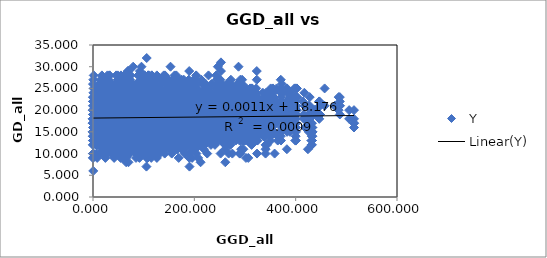
| Category | Y |
|---|---|
| 0.0 | 18 |
| 222.4649658203125 | 18 |
| 222.4649658203125 | 22 |
| 213.76522827148438 | 27 |
| 213.76522827148438 | 19 |
| 9.374117851257324 | 22 |
| 257.4018249511719 | 21 |
| 257.4018249511719 | 24 |
| 36.804473876953125 | 11 |
| 44.29213333129883 | 20 |
| 264.22344970703125 | 24 |
| 264.22344970703125 | 25 |
| 44.31821060180664 | 20 |
| 51.590065002441406 | 27 |
| 7.601124286651611 | 21 |
| 264.22344970703125 | 17 |
| 264.22344970703125 | 21 |
| 44.31821060180664 | 16 |
| 51.590065002441406 | 26 |
| 7.601124286651611 | 21 |
| 0.0 | 17 |
| 173.07127380371094 | 24 |
| 173.07127380371094 | 23 |
| 118.81575775146484 | 24 |
| 116.24177551269531 | 28 |
| 151.6311492919922 | 23 |
| 159.01612854003906 | 19 |
| 159.01612854003906 | 22 |
| 190.77919006347656 | 25 |
| 190.77919006347656 | 24 |
| 96.27040100097656 | 23 |
| 95.08282470703125 | 23 |
| 127.07388305664062 | 23 |
| 134.2930450439453 | 21 |
| 134.2930450439453 | 24 |
| 27.10545539855957 | 11 |
| 260.4430236816406 | 18 |
| 260.4430236816406 | 19 |
| 48.628448486328125 | 18 |
| 57.47843933105469 | 25 |
| 45.259212493896484 | 22 |
| 49.255279541015625 | 19 |
| 49.255279541015625 | 19 |
| 126.10540771484375 | 15 |
| 99.27521514892578 | 16 |
| 260.4430236816406 | 17 |
| 260.4430236816406 | 18 |
| 48.628448486328125 | 19 |
| 57.47843933105469 | 20 |
| 45.259212493896484 | 21 |
| 49.255279541015625 | 17 |
| 49.255279541015625 | 17 |
| 126.10540771484375 | 17 |
| 99.27521514892578 | 18 |
| 0.0 | 9 |
| 229.71290588378906 | 20 |
| 229.71290588378906 | 19 |
| 53.67777633666992 | 20 |
| 57.8973388671875 | 23 |
| 74.22978973388672 | 24 |
| 80.66748809814453 | 18 |
| 80.66748809814453 | 20 |
| 85.42356872558594 | 18 |
| 58.5223388671875 | 15 |
| 40.76374816894531 | 11 |
| 40.76374816894531 | 12 |
| 199.89532470703125 | 26 |
| 199.89532470703125 | 24 |
| 95.00555419921875 | 22 |
| 94.71145629882812 | 27 |
| 124.07469177246094 | 21 |
| 131.1192169189453 | 19 |
| 131.1192169189453 | 23 |
| 34.50121307373047 | 19 |
| 9.145140647888184 | 21 |
| 93.73696899414062 | 17 |
| 93.73696899414062 | 17 |
| 53.09325408935547 | 19 |
| 168.58895874023438 | 20 |
| 168.58895874023438 | 23 |
| 124.61155700683594 | 21 |
| 121.74211883544922 | 23 |
| 157.82974243164062 | 19 |
| 165.24754333496094 | 22 |
| 165.24754333496094 | 24 |
| 6.902673721313477 | 17 |
| 33.99543762207031 | 16 |
| 132.88478088378906 | 16 |
| 132.88478088378906 | 16 |
| 92.23468017578125 | 18 |
| 41.370235443115234 | 15 |
| 172.9572296142578 | 26 |
| 172.9572296142578 | 21 |
| 118.35059356689453 | 24 |
| 115.76432037353516 | 28 |
| 151.19163513183594 | 25 |
| 158.57936096191406 | 21 |
| 158.57936096191406 | 25 |
| 0.4980524182319641 | 14 |
| 26.79340934753418 | 18 |
| 125.7448959350586 | 12 |
| 125.7448959350586 | 19 |
| 85.07196807861328 | 17 |
| 34.26164627075195 | 17 |
| 7.202051639556885 | 18 |
| 173.07127380371094 | 22 |
| 173.07127380371094 | 18 |
| 118.81575775146484 | 20 |
| 116.24177551269531 | 22 |
| 151.6311492919922 | 20 |
| 159.01612854003906 | 19 |
| 159.01612854003906 | 18 |
| 0.0 | 13 |
| 27.10545539855957 | 17 |
| 126.10540771484375 | 9 |
| 126.10540771484375 | 13 |
| 85.42356872558594 | 15 |
| 34.50121307373047 | 13 |
| 6.902673721313477 | 17 |
| 0.4980524182319641 | 6 |
| 371.6860046386719 | 24 |
| 371.6860046386719 | 25 |
| 149.3632049560547 | 23 |
| 157.931884765625 | 24 |
| 114.56051635742188 | 26 |
| 108.13995361328125 | 26 |
| 108.13995361328125 | 23 |
| 246.0194549560547 | 19 |
| 218.96841430664062 | 20 |
| 120.48719787597656 | 18 |
| 120.48719787597656 | 17 |
| 160.7100067138672 | 21 |
| 212.62681579589844 | 22 |
| 252.86744689941406 | 16 |
| 245.6824188232422 | 20 |
| 246.0194549560547 | 15 |
| 248.31565856933594 | 19 |
| 248.31565856933594 | 23 |
| 82.35027313232422 | 20 |
| 87.39813232421875 | 23 |
| 96.56301879882812 | 24 |
| 101.88035583496094 | 20 |
| 101.88035583496094 | 20 |
| 88.33466339111328 | 16 |
| 62.37193298339844 | 14 |
| 54.16267776489258 | 11 |
| 54.16267776489258 | 14 |
| 29.965078353881836 | 15 |
| 53.961639404296875 | 18 |
| 95.13888549804688 | 13 |
| 88.1233139038086 | 16 |
| 88.33466339111328 | 15 |
| 163.852294921875 | 17 |
| 290.7441711425781 | 27 |
| 290.7441711425781 | 24 |
| 80.10026550292969 | 24 |
| 89.18231201171875 | 28 |
| 67.09288787841797 | 25 |
| 67.921142578125 | 24 |
| 67.921142578125 | 25 |
| 146.69772338867188 | 17 |
| 119.64244079589844 | 19 |
| 32.10920715332031 | 12 |
| 32.10920715332031 | 19 |
| 63.724605560302734 | 18 |
| 112.5268325805664 | 16 |
| 153.59983825683594 | 15 |
| 146.40512084960938 | 14 |
| 146.69772338867188 | 12 |
| 101.6820297241211 | 18 |
| 62.172630310058594 | 19 |
| 303.2703552246094 | 23 |
| 303.2703552246094 | 22 |
| 87.46601867675781 | 23 |
| 96.80699157714844 | 25 |
| 67.4734878540039 | 26 |
| 66.44381713867188 | 21 |
| 66.44381713867188 | 24 |
| 162.6663818359375 | 21 |
| 135.5751190185547 | 20 |
| 42.83417892456055 | 18 |
| 42.83417892456055 | 18 |
| 78.7713623046875 | 17 |
| 128.6339111328125 | 20 |
| 169.56417846679688 | 15 |
| 162.3635711669922 | 16 |
| 162.6663818359375 | 19 |
| 85.24528503417969 | 20 |
| 78.61475372314453 | 14 |
| 16.443693161010742 | 17 |
| 198.14268493652344 | 20 |
| 198.14268493652344 | 17 |
| 102.39704895019531 | 22 |
| 101.90559387207031 | 25 |
| 131.66151428222656 | 24 |
| 138.70901489257812 | 16 |
| 138.70901489257812 | 21 |
| 29.082876205444336 | 17 |
| 9.815465927124023 | 17 |
| 101.04747009277344 | 13 |
| 101.04747009277344 | 12 |
| 60.49484634399414 | 13 |
| 7.589998245239258 | 17 |
| 35.773502349853516 | 15 |
| 28.920522689819336 | 16 |
| 29.082876205444336 | 14 |
| 219.57435607910156 | 20 |
| 59.470767974853516 | 16 |
| 119.11138153076172 | 16 |
| 135.3101806640625 | 12 |
| 157.2509765625 | 23 |
| 157.2509765625 | 22 |
| 198.279541015625 | 21 |
| 194.47914123535156 | 26 |
| 232.45977783203125 | 23 |
| 239.93833923339844 | 22 |
| 239.93833923339844 | 21 |
| 81.66677856445312 | 21 |
| 108.281494140625 | 16 |
| 207.5562286376953 | 9 |
| 207.5562286376953 | 17 |
| 166.79855346679688 | 13 |
| 114.2761459350586 | 23 |
| 75.07343292236328 | 18 |
| 82.05875396728516 | 13 |
| 81.66677856445312 | 12 |
| 326.9018859863281 | 22 |
| 165.4676971435547 | 17 |
| 226.38809204101562 | 16 |
| 242.64572143554688 | 19 |
| 107.37771606445312 | 15 |
| 317.2943115234375 | 23 |
| 317.2943115234375 | 23 |
| 95.39566802978516 | 22 |
| 104.517822265625 | 25 |
| 64.8933334350586 | 26 |
| 60.490684509277344 | 20 |
| 60.490684509277344 | 23 |
| 187.7583770751953 | 20 |
| 160.7459716796875 | 20 |
| 62.12656784057617 | 12 |
| 62.12656784057617 | 17 |
| 102.38329315185547 | 15 |
| 154.59481811523438 | 19 |
| 194.59153747558594 | 20 |
| 187.41525268554688 | 17 |
| 187.7583770751953 | 13 |
| 58.37408447265625 | 19 |
| 107.56597900390625 | 18 |
| 46.50164031982422 | 19 |
| 31.206043243408203 | 17 |
| 161.64964294433594 | 18 |
| 268.8425598144531 | 19 |
| 275.63037109375 | 22 |
| 275.63037109375 | 17 |
| 64.51190948486328 | 25 |
| 73.50430297851562 | 22 |
| 55.235435485839844 | 27 |
| 57.42314910888672 | 24 |
| 57.42314910888672 | 23 |
| 135.768798828125 | 20 |
| 108.67538452148438 | 19 |
| 16.237546920776367 | 19 |
| 16.237546920776367 | 16 |
| 50.98674774169922 | 19 |
| 102.21112823486328 | 23 |
| 142.64208984375 | 15 |
| 135.44432067871094 | 20 |
| 135.768798828125 | 16 |
| 110.41656494140625 | 16 |
| 55.85599899291992 | 19 |
| 15.875600814819336 | 22 |
| 28.16462516784668 | 19 |
| 109.1721420288086 | 15 |
| 216.48538208007812 | 21 |
| 52.59881591796875 | 21 |
| 322.701171875 | 24 |
| 322.701171875 | 19 |
| 101.273681640625 | 24 |
| 110.47496795654297 | 23 |
| 71.64637756347656 | 25 |
| 67.45255279541016 | 22 |
| 67.45255279541016 | 23 |
| 190.45628356933594 | 15 |
| 163.3778076171875 | 16 |
| 65.68816375732422 | 10 |
| 65.68816375732422 | 18 |
| 105.3132553100586 | 17 |
| 156.9441375732422 | 20 |
| 197.31924438476562 | 17 |
| 190.1261444091797 | 9 |
| 190.45628356933594 | 7 |
| 55.70664978027344 | 20 |
| 108.55449676513672 | 16 |
| 46.62082290649414 | 15 |
| 30.459213256835938 | 20 |
| 163.8722686767578 | 13 |
| 271.2134704589844 | 12 |
| 7.208616733551025 | 16 |
| 54.738197326660156 | 15 |
| 310.5208740234375 | 18 |
| 310.5208740234375 | 20 |
| 88.81104278564453 | 18 |
| 97.98167419433594 | 25 |
| 59.183876037597656 | 21 |
| 55.232418060302734 | 20 |
| 55.232418060302734 | 18 |
| 181.04318237304688 | 16 |
| 154.0563507080078 | 17 |
| 55.27133560180664 | 10 |
| 55.27133560180664 | 11 |
| 95.6384048461914 | 13 |
| 147.9942169189453 | 16 |
| 187.8668975830078 | 14 |
| 180.6966094970703 | 13 |
| 181.04318237304688 | 10 |
| 65.21694946289062 | 16 |
| 101.57926177978516 | 16 |
| 41.33518981933594 | 12 |
| 27.064321517944336 | 16 |
| 155.08851623535156 | 12 |
| 262.208740234375 | 15 |
| 6.946103572845459 | 17 |
| 46.229427337646484 | 14 |
| 12.584607124328613 | 14 |
| 246.2540283203125 | 23 |
| 246.2540283203125 | 21 |
| 49.28633499145508 | 21 |
| 56.29104232788086 | 24 |
| 59.59392547607422 | 27 |
| 65.09765625 | 20 |
| 65.09765625 | 21 |
| 105.94261169433594 | 19 |
| 78.99954986572266 | 19 |
| 20.497783660888672 | 10 |
| 20.497783660888672 | 16 |
| 20.529987335205078 | 14 |
| 73.28009796142578 | 18 |
| 112.75993347167969 | 18 |
| 105.59336853027344 | 14 |
| 105.94261169433594 | 9 |
| 140.18898010253906 | 17 |
| 36.99909973144531 | 15 |
| 44.804874420166016 | 13 |
| 59.01220703125 | 20 |
| 80.56533813476562 | 17 |
| 187.24754333496094 | 16 |
| 81.85441589355469 | 13 |
| 30.915517807006836 | 18 |
| 84.85062408447266 | 9 |
| 75.1091537475586 | 14 |
| 275.8211669921875 | 25 |
| 275.8211669921875 | 25 |
| 65.03072357177734 | 20 |
| 74.00328063964844 | 25 |
| 55.947059631347656 | 24 |
| 58.144107818603516 | 26 |
| 58.144107818603516 | 27 |
| 135.5802459716797 | 20 |
| 108.48265075683594 | 19 |
| 16.66560935974121 | 15 |
| 16.66560935974121 | 21 |
| 50.89015579223633 | 16 |
| 101.97620391845703 | 24 |
| 142.45664978027344 | 19 |
| 135.25772094726562 | 15 |
| 135.5802459716797 | 15 |
| 110.6597900390625 | 24 |
| 55.39248275756836 | 17 |
| 15.488218307495117 | 18 |
| 28.128074645996094 | 22 |
| 108.91761016845703 | 20 |
| 216.2462158203125 | 16 |
| 52.914249420166016 | 19 |
| 0.7214439511299133 | 23 |
| 54.968017578125 | 13 |
| 46.58121109008789 | 19 |
| 30.900455474853516 | 13 |
| 347.0801086425781 | 24 |
| 347.0801086425781 | 21 |
| 125.58894348144531 | 21 |
| 134.75660705566406 | 24 |
| 94.96224975585938 | 23 |
| 90.15449523925781 | 19 |
| 90.15449523925781 | 22 |
| 212.32965087890625 | 18 |
| 185.22657775878906 | 16 |
| 89.16010284423828 | 11 |
| 89.16010284423828 | 16 |
| 127.8288803100586 | 16 |
| 178.3788299560547 | 15 |
| 219.2220001220703 | 16 |
| 212.0199737548828 | 12 |
| 212.32965087890625 | 8 |
| 37.504554748535156 | 17 |
| 127.95357513427734 | 16 |
| 66.0609359741211 | 14 |
| 49.76592254638672 | 20 |
| 185.0752410888672 | 15 |
| 292.40966796875 | 11 |
| 30.32223129272461 | 11 |
| 76.84693145751953 | 18 |
| 24.390153884887695 | 9 |
| 36.77824020385742 | 15 |
| 107.58628845214844 | 9 |
| 76.96444702148438 | 12 |
| 246.2540283203125 | 20 |
| 246.2540283203125 | 18 |
| 49.28633499145508 | 21 |
| 56.29104232788086 | 22 |
| 59.59392547607422 | 25 |
| 65.09765625 | 16 |
| 65.09765625 | 20 |
| 105.94261169433594 | 15 |
| 78.99954986572266 | 16 |
| 20.497783660888672 | 10 |
| 20.497783660888672 | 12 |
| 20.529987335205078 | 14 |
| 73.28009796142578 | 13 |
| 112.75993347167969 | 15 |
| 105.59336853027344 | 12 |
| 105.94261169433594 | 11 |
| 140.18898010253906 | 18 |
| 36.99909973144531 | 11 |
| 44.804874420166016 | 17 |
| 59.01220703125 | 16 |
| 80.56533813476562 | 12 |
| 187.24754333496094 | 18 |
| 81.85441589355469 | 15 |
| 30.915517807006836 | 15 |
| 84.85062408447266 | 10 |
| 75.1091537475586 | 12 |
| 0.0 | 9 |
| 30.900455474853516 | 16 |
| 107.58628845214844 | 13 |
| 322.07733154296875 | 18 |
| 322.07733154296875 | 19 |
| 100.55109405517578 | 19 |
| 109.73844909667969 | 28 |
| 70.74176025390625 | 23 |
| 66.49687194824219 | 19 |
| 66.49687194824219 | 19 |
| 190.28704833984375 | 16 |
| 163.2164306640625 | 17 |
| 65.3514175415039 | 10 |
| 65.3514175415039 | 10 |
| 105.09424591064453 | 16 |
| 156.8266143798828 | 18 |
| 197.14581298828125 | 17 |
| 189.95481872558594 | 17 |
| 190.28704833984375 | 13 |
| 55.801475524902344 | 21 |
| 108.63719940185547 | 15 |
| 46.79303741455078 | 19 |
| 30.723114013671875 | 22 |
| 163.7754669189453 | 16 |
| 271.1009216308594 | 15 |
| 6.160338878631592 | 18 |
| 54.6156120300293 | 16 |
| 1.0853439569473267 | 18 |
| 11.781150817871094 | 12 |
| 84.61422729492188 | 17 |
| 54.858856201171875 | 21 |
| 25.057863235473633 | 13 |
| 84.61422729492188 | 12 |
| 337.5080871582031 | 22 |
| 337.5080871582031 | 21 |
| 116.46410369873047 | 24 |
| 125.69670104980469 | 27 |
| 86.92608642578125 | 26 |
| 82.56330108642578 | 23 |
| 82.56330108642578 | 22 |
| 202.18360900878906 | 17 |
| 175.0794677734375 | 18 |
| 79.09371185302734 | 15 |
| 79.09371185302734 | 18 |
| 117.6618881225586 | 16 |
| 168.26004028320312 | 21 |
| 209.0747528076172 | 18 |
| 201.87269592285156 | 15 |
| 202.18360900878906 | 15 |
| 46.45109176635742 | 19 |
| 118.05816650390625 | 19 |
| 56.043670654296875 | 17 |
| 39.69001770019531 | 17 |
| 174.97857666015625 | 15 |
| 282.3282775878906 | 16 |
| 22.077699661254883 | 21 |
| 66.67927551269531 | 14 |
| 15.347365379333496 | 14 |
| 27.93012237548828 | 10 |
| 97.4280776977539 | 18 |
| 66.79673767089844 | 22 |
| 10.167814254760742 | 18 |
| 97.4280776977539 | 15 |
| 16.202625274658203 | 16 |
| 314.158447265625 | 22 |
| 314.158447265625 | 25 |
| 92.92469787597656 | 21 |
| 102.1614761352539 | 28 |
| 64.17893981933594 | 24 |
| 60.44082260131836 | 18 |
| 60.44082260131836 | 19 |
| 182.37896728515625 | 17 |
| 155.32546997070312 | 20 |
| 57.24617004394531 | 16 |
| 57.24617004394531 | 17 |
| 97.11376190185547 | 17 |
| 149.02572631835938 | 20 |
| 189.2296905517578 | 20 |
| 182.04299926757812 | 22 |
| 182.37896728515625 | 18 |
| 63.642948150634766 | 23 |
| 101.43550872802734 | 20 |
| 40.110755920410156 | 20 |
| 24.724863052368164 | 16 |
| 156.0201416015625 | 18 |
| 263.3000183105469 | 21 |
| 6.481231212615967 | 15 |
| 46.856040954589844 | 21 |
| 8.598342895507812 | 20 |
| 5.465921401977539 | 15 |
| 76.61265563964844 | 17 |
| 47.13227081298828 | 22 |
| 32.9228630065918 | 18 |
| 76.61265563964844 | 17 |
| 8.132476806640625 | 19 |
| 23.539653778076172 | 14 |
| 246.2540283203125 | 20 |
| 246.2540283203125 | 21 |
| 49.28633499145508 | 22 |
| 56.29104232788086 | 23 |
| 59.59392547607422 | 24 |
| 65.09765625 | 18 |
| 65.09765625 | 21 |
| 105.94261169433594 | 12 |
| 78.99954986572266 | 15 |
| 20.497783660888672 | 14 |
| 20.497783660888672 | 17 |
| 20.529987335205078 | 13 |
| 73.28009796142578 | 17 |
| 112.75993347167969 | 13 |
| 105.59336853027344 | 14 |
| 105.94261169433594 | 14 |
| 140.18898010253906 | 16 |
| 36.99909973144531 | 15 |
| 44.804874420166016 | 18 |
| 59.01220703125 | 19 |
| 80.56533813476562 | 14 |
| 187.24754333496094 | 16 |
| 81.85441589355469 | 15 |
| 30.915517807006836 | 15 |
| 84.85062408447266 | 14 |
| 75.1091537475586 | 15 |
| 0.0 | 17 |
| 30.900455474853516 | 20 |
| 107.58628845214844 | 15 |
| 0.0 | 15 |
| 84.61422729492188 | 16 |
| 97.4280776977539 | 12 |
| 76.61265563964844 | 19 |
| 266.0417785644531 | 26 |
| 266.0417785644531 | 21 |
| 64.40113067626953 | 25 |
| 72.5329818725586 | 20 |
| 64.17170715332031 | 22 |
| 67.83060455322266 | 19 |
| 67.83060455322266 | 20 |
| 120.96961212158203 | 19 |
| 93.87242126464844 | 16 |
| 18.993860244750977 | 15 |
| 18.993860244750977 | 15 |
| 37.68875503540039 | 16 |
| 87.04053497314453 | 18 |
| 127.86532592773438 | 18 |
| 120.66390228271484 | 16 |
| 120.96961212158203 | 12 |
| 125.83783721923828 | 20 |
| 39.852237701416016 | 19 |
| 26.105321884155273 | 19 |
| 41.71109390258789 | 20 |
| 93.83827209472656 | 17 |
| 201.21588134765625 | 14 |
| 68.41474914550781 | 20 |
| 16.04729652404785 | 16 |
| 70.14277648925781 | 12 |
| 62.16349411010742 | 16 |
| 19.970983505249023 | 17 |
| 15.626886367797852 | 22 |
| 91.3724594116211 | 16 |
| 19.970983505249023 | 15 |
| 70.09640502929688 | 18 |
| 81.23793029785156 | 14 |
| 62.516632080078125 | 21 |
| 19.970983505249023 | 13 |
| 371.4516906738281 | 23 |
| 371.4516906738281 | 20 |
| 148.9880828857422 | 21 |
| 157.73440551757812 | 23 |
| 114.93942260742188 | 22 |
| 108.81005859375 | 14 |
| 108.81005859375 | 20 |
| 242.89808654785156 | 14 |
| 215.8076934814453 | 12 |
| 117.96956634521484 | 14 |
| 117.96956634521484 | 12 |
| 157.79806518554688 | 12 |
| 209.2581329345703 | 19 |
| 249.7676544189453 | 18 |
| 242.57159423828125 | 19 |
| 242.89808654785156 | 16 |
| 7.60078763961792 | 21 |
| 159.6901092529297 | 14 |
| 97.5710678100586 | 20 |
| 81.1413345336914 | 19 |
| 216.10540771484375 | 15 |
| 323.4817199707031 | 16 |
| 55.97972869873047 | 16 |
| 107.13277435302734 | 18 |
| 52.48496627807617 | 18 |
| 62.91604995727539 | 14 |
| 137.3286895751953 | 17 |
| 107.33283996582031 | 20 |
| 32.14366912841797 | 15 |
| 137.3286895751953 | 11 |
| 52.71681213378906 | 11 |
| 41.694725036621094 | 19 |
| 60.760536193847656 | 17 |
| 137.3286895751953 | 16 |
| 122.26859283447266 | 16 |
| 253.3990936279297 | 20 |
| 253.3990936279297 | 21 |
| 42.96011734008789 | 20 |
| 51.53498840332031 | 24 |
| 44.5643424987793 | 23 |
| 49.48000717163086 | 21 |
| 49.48000717163086 | 20 |
| 120.50138854980469 | 18 |
| 93.8476333618164 | 15 |
| 7.045741558074951 | 12 |
| 7.045741558074951 | 15 |
| 35.593868255615234 | 12 |
| 88.6811294555664 | 21 |
| 127.23346710205078 | 17 |
| 120.12918853759766 | 12 |
| 120.50138854980469 | 11 |
| 126.72303771972656 | 21 |
| 52.47110366821289 | 13 |
| 38.83311462402344 | 19 |
| 49.87989044189453 | 18 |
| 96.08831787109375 | 16 |
| 202.08428955078125 | 11 |
| 68.44416046142578 | 20 |
| 22.983238220214844 | 18 |
| 72.26660919189453 | 11 |
| 61.540462493896484 | 15 |
| 16.38667106628418 | 14 |
| 23.345216751098633 | 11 |
| 95.91696166992188 | 13 |
| 16.38667106628418 | 14 |
| 71.89149475097656 | 16 |
| 85.88482666015625 | 16 |
| 63.76576232910156 | 18 |
| 16.38667106628418 | 17 |
| 22.048954010009766 | 16 |
| 124.38761901855469 | 15 |
| 322.1430969238281 | 25 |
| 322.1430969238281 | 22 |
| 102.78824615478516 | 24 |
| 112.13762664794922 | 26 |
| 76.5759048461914 | 25 |
| 73.45314025878906 | 22 |
| 73.45314025878906 | 23 |
| 184.43881225585938 | 18 |
| 157.3392333984375 | 16 |
| 62.41310119628906 | 14 |
| 62.41310119628906 | 19 |
| 100.16773223876953 | 17 |
| 150.45802307128906 | 21 |
| 191.33360290527344 | 21 |
| 184.1318817138672 | 14 |
| 184.43881225585938 | 13 |
| 63.83725357055664 | 23 |
| 100.25872039794922 | 16 |
| 38.195613861083984 | 19 |
| 21.845632553100586 | 21 |
| 157.15179443359375 | 21 |
| 264.4911804199219 | 14 |
| 18.144147872924805 | 16 |
| 49.20880126953125 | 20 |
| 12.842070579528809 | 12 |
| 19.571046829223633 | 16 |
| 80.08827209472656 | 15 |
| 49.28187561035156 | 15 |
| 27.923999786376953 | 13 |
| 80.08827209472656 | 12 |
| 13.704874992370605 | 14 |
| 17.851314544677734 | 16 |
| 14.151626586914062 | 21 |
| 80.08827209472656 | 16 |
| 63.47031784057617 | 12 |
| 59.433719635009766 | 12 |
| 69.34391021728516 | 16 |
| 272.87005615234375 | 23 |
| 272.87005615234375 | 18 |
| 59.59221267700195 | 21 |
| 65.10609436035156 | 25 |
| 26.39765167236328 | 24 |
| 20.16983985900879 | 19 |
| 20.16983985900879 | 20 |
| 177.16690063476562 | 16 |
| 153.05776977539062 | 15 |
| 69.01828002929688 | 13 |
| 69.01828002929688 | 17 |
| 100.58642578125 | 14 |
| 150.2998809814453 | 16 |
| 183.23406982421875 | 16 |
| 176.71815490722656 | 11 |
| 177.16690063476562 | 13 |
| 104.46272277832031 | 18 |
| 122.0223388671875 | 17 |
| 84.41395568847656 | 15 |
| 80.03258514404297 | 17 |
| 157.88015747070312 | 13 |
| 257.499755859375 | 13 |
| 66.4549560546875 | 18 |
| 75.71920013427734 | 17 |
| 73.66108703613281 | 11 |
| 62.84366226196289 | 14 |
| 85.2669448852539 | 16 |
| 76.4376220703125 | 19 |
| 93.53524017333984 | 15 |
| 85.2669448852539 | 12 |
| 72.60154724121094 | 14 |
| 87.63310241699219 | 11 |
| 68.30953216552734 | 19 |
| 85.2669448852539 | 11 |
| 87.2691421508789 | 12 |
| 106.52696990966797 | 16 |
| 69.58397674560547 | 11 |
| 82.31547546386719 | 14 |
| 163.29869079589844 | 25 |
| 163.29869079589844 | 23 |
| 183.23289489746094 | 21 |
| 179.87681579589844 | 22 |
| 216.80081176757812 | 23 |
| 224.2255401611328 | 19 |
| 224.2255401611328 | 24 |
| 65.33116912841797 | 19 |
| 91.49834442138672 | 14 |
| 190.68466186523438 | 16 |
| 190.68466186523438 | 19 |
| 149.9243927001953 | 17 |
| 97.14375305175781 | 18 |
| 58.9804573059082 | 17 |
| 65.75020599365234 | 16 |
| 65.33116912841797 | 14 |
| 309.6938781738281 | 13 |
| 147.88108825683594 | 18 |
| 208.9736785888672 | 16 |
| 225.2657470703125 | 19 |
| 90.11981201171875 | 19 |
| 17.70936393737793 | 17 |
| 251.73341369628906 | 17 |
| 199.2902069091797 | 18 |
| 253.99072265625 | 14 |
| 245.137939453125 | 16 |
| 170.3062286376953 | 13 |
| 199.0373077392578 | 17 |
| 275.0196228027344 | 10 |
| 170.3062286376953 | 15 |
| 253.89527893066406 | 18 |
| 264.955078125 | 17 |
| 246.1334686279297 | 18 |
| 170.3062286376953 | 18 |
| 183.92430114746094 | 17 |
| 306.1881408691406 | 17 |
| 185.341064453125 | 17 |
| 247.1102752685547 | 14 |
| 242.12570190429688 | 16 |
| 173.42236328125 | 24 |
| 173.42236328125 | 20 |
| 116.27494812011719 | 23 |
| 113.70842742919922 | 23 |
| 149.11053466796875 | 23 |
| 156.49942016601562 | 20 |
| 156.49942016601562 | 19 |
| 2.5408098697662354 | 17 |
| 24.936208724975586 | 17 |
| 123.76537322998047 | 14 |
| 123.76537322998047 | 16 |
| 83.11127471923828 | 14 |
| 32.597015380859375 | 18 |
| 9.12341594696045 | 18 |
| 2.082908868789673 | 17 |
| 2.5408098697662354 | 13 |
| 243.74871826171875 | 23 |
| 86.52181243896484 | 18 |
| 144.57583618164062 | 20 |
| 160.50881958007812 | 21 |
| 27.506633758544922 | 15 |
| 84.09532165527344 | 15 |
| 185.46937561035156 | 19 |
| 133.53968811035156 | 18 |
| 188.20791625976562 | 14 |
| 178.7437286376953 | 14 |
| 103.63656616210938 | 16 |
| 133.3574981689453 | 18 |
| 210.14794921875 | 14 |
| 103.63656616210938 | 12 |
| 188.03201293945312 | 16 |
| 199.9979248046875 | 17 |
| 180.11221313476562 | 17 |
| 103.63656616210938 | 16 |
| 118.8034896850586 | 17 |
| 240.66078186035156 | 12 |
| 118.12832641601562 | 11 |
| 182.26678466796875 | 16 |
| 174.63525390625 | 12 |
| 67.818603515625 | 18 |
| 212.7285919189453 | 22 |
| 212.7285919189453 | 15 |
| 107.06124114990234 | 26 |
| 107.82450103759766 | 25 |
| 133.32872009277344 | 27 |
| 140.02159118652344 | 24 |
| 140.02159118652344 | 19 |
| 41.4451789855957 | 22 |
| 24.168949127197266 | 22 |
| 98.64021301269531 | 14 |
| 98.64021301269531 | 17 |
| 59.63274383544922 | 20 |
| 16.983652114868164 | 19 |
| 47.556270599365234 | 19 |
| 41.40073776245117 | 17 |
| 41.4451789855957 | 12 |
| 214.45970153808594 | 22 |
| 51.295169830322266 | 20 |
| 113.00825500488281 | 18 |
| 129.42050170898438 | 21 |
| 14.990262031555176 | 15 |
| 114.28377532958984 | 19 |
| 157.25640869140625 | 18 |
| 104.7035903930664 | 15 |
| 158.86227416992188 | 12 |
| 150.9326171875 | 16 |
| 78.3085708618164 | 13 |
| 104.36115264892578 | 20 |
| 179.01605224609375 | 11 |
| 78.3085708618164 | 14 |
| 158.8605499267578 | 16 |
| 169.04298400878906 | 19 |
| 151.35743713378906 | 20 |
| 78.3085708618164 | 18 |
| 88.84918212890625 | 16 |
| 210.557861328125 | 19 |
| 94.49874114990234 | 18 |
| 151.2008819580078 | 16 |
| 159.72384643554688 | 16 |
| 96.65325164794922 | 18 |
| 40.383426666259766 | 16 |
| 279.1083068847656 | 20 |
| 279.1083068847656 | 23 |
| 63.67301559448242 | 23 |
| 69.82164764404297 | 26 |
| 28.410476684570312 | 26 |
| 21.189693450927734 | 21 |
| 21.189693450927734 | 22 |
| 180.0323028564453 | 20 |
| 155.4495391845703 | 14 |
| 67.974365234375 | 16 |
| 67.974365234375 | 15 |
| 101.62791442871094 | 17 |
| 152.30873107910156 | 19 |
| 186.21299743652344 | 17 |
| 179.5917205810547 | 23 |
| 180.0323028564453 | 18 |
| 97.40923309326172 | 19 |
| 121.68164825439453 | 15 |
| 80.80164337158203 | 22 |
| 75.29664611816406 | 19 |
| 159.8985595703125 | 14 |
| 260.7675476074219 | 19 |
| 60.0362434387207 | 20 |
| 73.22096252441406 | 16 |
| 67.22630310058594 | 20 |
| 56.75501251220703 | 15 |
| 85.31087493896484 | 20 |
| 73.93069458007812 | 25 |
| 86.66141510009766 | 19 |
| 85.31087493896484 | 14 |
| 66.15762329101562 | 15 |
| 80.96370697021484 | 18 |
| 62.212860107421875 | 20 |
| 85.31087493896484 | 15 |
| 85.67324829101562 | 20 |
| 99.42938995361328 | 15 |
| 69.25655364990234 | 21 |
| 76.30486297607422 | 17 |
| 7.106637001037598 | 18 |
| 245.17568969726562 | 16 |
| 177.51025390625 | 15 |
| 161.09756469726562 | 22 |
| 268.3861083984375 | 21 |
| 268.3861083984375 | 22 |
| 64.70867919921875 | 23 |
| 73.05021667480469 | 27 |
| 62.65156936645508 | 25 |
| 66.02285766601562 | 27 |
| 66.02285766601562 | 23 |
| 124.12468719482422 | 23 |
| 97.02349853515625 | 22 |
| 17.877960205078125 | 19 |
| 17.877960205078125 | 16 |
| 40.538700103759766 | 20 |
| 90.2349853515625 | 23 |
| 131.0184326171875 | 16 |
| 123.81657409667969 | 23 |
| 124.12468719482422 | 19 |
| 122.60587310791016 | 20 |
| 42.980384826660156 | 21 |
| 23.185932159423828 | 25 |
| 38.59187698364258 | 18 |
| 97.05059814453125 | 19 |
| 204.42721557617188 | 18 |
| 65.17626190185547 | 21 |
| 12.877537727355957 | 16 |
| 66.90821075439453 | 22 |
| 58.93490219116211 | 17 |
| 22.139118194580078 | 24 |
| 12.432199478149414 | 26 |
| 88.2066421508789 | 22 |
| 22.139118194580078 | 20 |
| 66.85899353027344 | 14 |
| 78.06583404541016 | 18 |
| 59.275550842285156 | 21 |
| 22.139118194580078 | 17 |
| 3.2410898208618164 | 19 |
| 119.0548095703125 | 20 |
| 21.89412498474121 | 20 |
| 60.31649398803711 | 21 |
| 85.26425170898438 | 19 |
| 187.1436767578125 | 23 |
| 121.9502944946289 | 21 |
| 92.08968353271484 | 22 |
| 83.46929168701172 | 18 |
| 325.3088073730469 | 20 |
| 325.3088073730469 | 20 |
| 106.6766586303711 | 21 |
| 116.04119110107422 | 21 |
| 81.1604232788086 | 25 |
| 78.17864227294922 | 20 |
| 78.17864227294922 | 19 |
| 185.7647705078125 | 21 |
| 158.691162109375 | 17 |
| 65.14936828613281 | 13 |
| 65.14936828613281 | 10 |
| 102.01789855957031 | 12 |
| 151.62796020507812 | 20 |
| 192.66566467285156 | 16 |
| 185.4679718017578 | 20 |
| 185.7647705078125 | 15 |
| 64.26429748535156 | 15 |
| 100.6883316040039 | 15 |
| 39.10292434692383 | 16 |
| 23.25014305114746 | 15 |
| 158.20751953125 | 13 |
| 265.4496154785156 | 16 |
| 22.758222579956055 | 19 |
| 51.2675895690918 | 16 |
| 16.858482360839844 | 18 |
| 24.484466552734375 | 12 |
| 82.17593383789062 | 15 |
| 51.276466369628906 | 21 |
| 27.335224151611328 | 17 |
| 82.17593383789062 | 13 |
| 17.82623863220215 | 18 |
| 17.813575744628906 | 17 |
| 19.056655883789062 | 18 |
| 82.17593383789062 | 16 |
| 64.88721466064453 | 18 |
| 59.381778717041016 | 17 |
| 72.14412689208984 | 17 |
| 4.915616035461426 | 20 |
| 87.22418975830078 | 17 |
| 248.00779724121094 | 18 |
| 183.62734985351562 | 18 |
| 151.8284454345703 | 17 |
| 81.22037506103516 | 14 |
| 61.79828643798828 | 20 |
| 370.94586181640625 | 24 |
| 370.94586181640625 | 19 |
| 148.5832977294922 | 27 |
| 157.18319702148438 | 27 |
| 113.9012222290039 | 27 |
| 107.53022766113281 | 25 |
| 107.53022766113281 | 20 |
| 244.8411102294922 | 26 |
| 217.78363037109375 | 23 |
| 119.37660217285156 | 19 |
| 119.37660217285156 | 16 |
| 159.55288696289062 | 19 |
| 211.4153594970703 | 23 |
| 251.6921844482422 | 22 |
| 244.50540161132812 | 25 |
| 244.8411102294922 | 20 |
| 1.482221245765686 | 28 |
| 162.5447540283203 | 24 |
| 100.3724594116211 | 26 |
| 83.93260192871094 | 22 |
| 218.35084533691406 | 19 |
| 325.6882019042969 | 20 |
| 57.25260925292969 | 21 |
| 109.20433044433594 | 20 |
| 54.478580474853516 | 22 |
| 64.11371612548828 | 19 |
| 139.03602600097656 | 24 |
| 109.44229888916016 | 28 |
| 36.06285858154297 | 21 |
| 139.03602600097656 | 20 |
| 54.589900970458984 | 16 |
| 45.05929183959961 | 16 |
| 62.462501525878906 | 15 |
| 139.03602600097656 | 22 |
| 124.59381103515625 | 19 |
| 6.326123237609863 | 18 |
| 125.63880157470703 | 19 |
| 62.48673629760742 | 23 |
| 104.11554718017578 | 18 |
| 308.4691467285156 | 24 |
| 242.5745849609375 | 17 |
| 213.18435668945312 | 17 |
| 97.05036926269531 | 22 |
| 121.3635025024414 | 17 |
| 62.87062072753906 | 22 |
| 457.16949462890625 | 25 |
| 457.16949462890625 | 21 |
| 235.93397521972656 | 23 |
| 244.1123046875 | 27 |
| 199.9834747314453 | 25 |
| 193.0093536376953 | 17 |
| 193.0093536376953 | 22 |
| 333.76434326171875 | 19 |
| 306.6706848144531 | 20 |
| 208.63197326660156 | 15 |
| 208.63197326660156 | 17 |
| 248.64854431152344 | 16 |
| 300.06317138671875 | 23 |
| 340.6357116699219 | 21 |
| 333.4389343261719 | 21 |
| 333.76434326171875 | 19 |
| 88.20744323730469 | 25 |
| 249.79876708984375 | 21 |
| 187.97027587890625 | 23 |
| 171.62741088867188 | 16 |
| 306.85736083984375 | 17 |
| 414.22955322265625 | 22 |
| 146.50726318359375 | 15 |
| 197.99583435058594 | 22 |
| 143.34568786621094 | 20 |
| 153.38525390625 | 20 |
| 228.16160583496094 | 20 |
| 198.1892852783203 | 26 |
| 121.91532897949219 | 21 |
| 228.16160583496094 | 17 |
| 143.55433654785156 | 20 |
| 131.93927001953125 | 22 |
| 151.55252075195312 | 20 |
| 228.16160583496094 | 17 |
| 213.03201293945312 | 22 |
| 90.8706283569336 | 19 |
| 214.91664123535156 | 22 |
| 149.78985595703125 | 23 |
| 185.27052307128906 | 20 |
| 396.8823547363281 | 23 |
| 331.5299987792969 | 19 |
| 300.9230651855469 | 21 |
| 178.67147827148438 | 19 |
| 209.8306427001953 | 19 |
| 149.11337280273438 | 17 |
| 89.27816009521484 | 20 |
| 279.1083068847656 | 25 |
| 279.1083068847656 | 23 |
| 63.67301559448242 | 23 |
| 69.82164764404297 | 29 |
| 28.410476684570312 | 28 |
| 21.189693450927734 | 19 |
| 21.189693450927734 | 25 |
| 180.0323028564453 | 23 |
| 155.4495391845703 | 21 |
| 67.974365234375 | 18 |
| 67.974365234375 | 20 |
| 101.62791442871094 | 17 |
| 152.30873107910156 | 24 |
| 186.21299743652344 | 20 |
| 179.5917205810547 | 22 |
| 180.0323028564453 | 22 |
| 97.40923309326172 | 23 |
| 121.68164825439453 | 22 |
| 80.80164337158203 | 22 |
| 75.29664611816406 | 15 |
| 159.8985595703125 | 17 |
| 260.7675476074219 | 16 |
| 60.0362434387207 | 18 |
| 73.22096252441406 | 19 |
| 67.22630310058594 | 21 |
| 56.75501251220703 | 19 |
| 85.31087493896484 | 21 |
| 73.93069458007812 | 26 |
| 86.66141510009766 | 20 |
| 85.31087493896484 | 17 |
| 66.15762329101562 | 18 |
| 80.96370697021484 | 19 |
| 62.212860107421875 | 19 |
| 85.31087493896484 | 19 |
| 85.67324829101562 | 21 |
| 99.42938995361328 | 15 |
| 69.25655364990234 | 21 |
| 76.30486297607422 | 20 |
| 7.106637001037598 | 17 |
| 245.17568969726562 | 18 |
| 177.51025390625 | 22 |
| 161.09756469726562 | 24 |
| 0.0 | 20 |
| 83.46929168701172 | 17 |
| 81.22037506103516 | 18 |
| 97.05036926269531 | 19 |
| 178.67147827148438 | 18 |
| 248.3763427734375 | 23 |
| 248.3763427734375 | 23 |
| 89.6947250366211 | 24 |
| 94.3753433227539 | 21 |
| 104.75171661376953 | 23 |
| 110.10242462158203 | 18 |
| 110.10242462158203 | 23 |
| 85.00935363769531 | 21 |
| 60.01789855957031 | 17 |
| 62.35111999511719 | 19 |
| 62.35111999511719 | 15 |
| 36.52766418457031 | 17 |
| 51.193275451660156 | 21 |
| 91.69307708740234 | 19 |
| 84.83805847167969 | 21 |
| 85.00935363769531 | 18 |
| 170.4931640625 | 20 |
| 8.232808113098145 | 16 |
| 68.8892822265625 | 24 |
| 85.28121948242188 | 18 |
| 55.93062210083008 | 16 |
| 160.41050720214844 | 20 |
| 114.74307250976562 | 21 |
| 63.502445220947266 | 21 |
| 115.45804595947266 | 19 |
| 108.88775634765625 | 18 |
| 45.16642379760742 | 20 |
| 63.01080322265625 | 22 |
| 134.2421417236328 | 15 |
| 45.16642379760742 | 16 |
| 115.58369445800781 | 18 |
| 124.45266723632812 | 22 |
| 108.53717803955078 | 22 |
| 45.16642379760742 | 20 |
| 47.59300231933594 | 18 |
| 166.14047241210938 | 13 |
| 60.7028923034668 | 18 |
| 106.73428344726562 | 17 |
| 130.24781799316406 | 21 |
| 142.75193786621094 | 15 |
| 83.36043548583984 | 17 |
| 46.17338180541992 | 19 |
| 129.91363525390625 | 17 |
| 50.660499572753906 | 23 |
| 106.91593170166016 | 16 |
| 169.1657257080078 | 25 |
| 255.91036987304688 | 23 |
| 129.91363525390625 | 20 |
| 418.44354248046875 | 18 |
| 418.44354248046875 | 16 |
| 196.58590698242188 | 25 |
| 204.9398193359375 | 26 |
| 161.0434112548828 | 28 |
| 154.2604522705078 | 22 |
| 154.2604522705078 | 17 |
| 293.6042175292969 | 21 |
| 266.517333984375 | 22 |
| 168.41448974609375 | 21 |
| 168.41448974609375 | 16 |
| 208.44515991210938 | 19 |
| 259.97174072265625 | 20 |
| 300.4710388183594 | 17 |
| 293.2762451171875 | 20 |
| 293.6042175292969 | 18 |
| 48.03892135620117 | 21 |
| 210.0885772705078 | 20 |
| 148.09332275390625 | 24 |
| 131.7008819580078 | 19 |
| 266.806640625 | 15 |
| 374.1842956542969 | 24 |
| 106.29146575927734 | 20 |
| 157.84474182128906 | 17 |
| 103.15790557861328 | 19 |
| 113.17448425292969 | 16 |
| 187.95223999023438 | 18 |
| 158.04766845703125 | 22 |
| 82.13864135742188 | 18 |
| 187.95223999023438 | 13 |
| 103.3541488647461 | 19 |
| 92.05796813964844 | 19 |
| 111.34041595458984 | 20 |
| 187.95223999023438 | 17 |
| 172.96841430664062 | 20 |
| 50.7164421081543 | 17 |
| 174.71099853515625 | 20 |
| 109.8987045288086 | 19 |
| 147.96786499023438 | 18 |
| 356.8743591308594 | 21 |
| 291.3617858886719 | 17 |
| 261.0993957519531 | 12 |
| 141.15621948242188 | 18 |
| 169.75833129882812 | 21 |
| 109.44676208496094 | 17 |
| 49.08271408081055 | 21 |
| 40.21924591064453 | 22 |
| 141.15621948242188 | 24 |
| 216.360107421875 | 19 |
| 323.26678466796875 | 29 |
| 323.26678466796875 | 27 |
| 101.81975555419922 | 25 |
| 111.0176010131836 | 24 |
| 72.12458038330078 | 26 |
| 67.89889526367188 | 24 |
| 67.89889526367188 | 28 |
| 191.022705078125 | 19 |
| 163.94332885742188 | 19 |
| 66.26802062988281 | 19 |
| 66.26802062988281 | 17 |
| 105.88530731201172 | 17 |
| 157.5038299560547 | 19 |
| 197.88613891601562 | 25 |
| 190.6928253173828 | 25 |
| 191.022705078125 | 21 |
| 55.1529655456543 | 28 |
| 109.0766372680664 | 23 |
| 47.12253952026367 | 25 |
| 30.9365177154541 | 27 |
| 164.42884826660156 | 22 |
| 271.7721862792969 | 26 |
| 7.563344478607178 | 21 |
| 55.299705505371094 | 27 |
| 0.5809029340744019 | 27 |
| 13.102757453918457 | 22 |
| 85.42436218261719 | 25 |
| 55.52763748168945 | 20 |
| 23.829504013061523 | 23 |
| 85.42436218261719 | 21 |
| 1.4097023010253906 | 19 |
| 14.84092903137207 | 27 |
| 9.175464630126953 | 25 |
| 85.42436218261719 | 20 |
| 70.69200897216797 | 26 |
| 51.91337966918945 | 16 |
| 72.84735870361328 | 25 |
| 13.022035598754883 | 26 |
| 73.99083709716797 | 24 |
| 254.54685974121094 | 25 |
| 188.77511596679688 | 21 |
| 159.40220642089844 | 27 |
| 67.53546142578125 | 20 |
| 67.45801544189453 | 27 |
| 16.92671775817871 | 21 |
| 53.92230224609375 | 25 |
| 142.7757110595703 | 20 |
| 67.53546142578125 | 28 |
| 115.9695816040039 | 24 |
| 102.58946228027344 | 26 |
| 248.3763427734375 | 21 |
| 248.3763427734375 | 21 |
| 89.6947250366211 | 22 |
| 94.3753433227539 | 21 |
| 104.75171661376953 | 22 |
| 110.10242462158203 | 18 |
| 110.10242462158203 | 21 |
| 85.00935363769531 | 16 |
| 60.01789855957031 | 14 |
| 62.35111999511719 | 13 |
| 62.35111999511719 | 13 |
| 36.52766418457031 | 13 |
| 51.193275451660156 | 18 |
| 91.69307708740234 | 13 |
| 84.83805847167969 | 16 |
| 85.00935363769531 | 16 |
| 170.4931640625 | 16 |
| 8.232808113098145 | 12 |
| 68.8892822265625 | 16 |
| 85.28121948242188 | 10 |
| 55.93062210083008 | 11 |
| 160.41050720214844 | 12 |
| 114.74307250976562 | 19 |
| 63.502445220947266 | 16 |
| 115.45804595947266 | 15 |
| 108.88775634765625 | 14 |
| 45.16642379760742 | 18 |
| 63.01080322265625 | 20 |
| 134.2421417236328 | 14 |
| 45.16642379760742 | 13 |
| 115.58369445800781 | 16 |
| 124.45266723632812 | 13 |
| 108.53717803955078 | 19 |
| 45.16642379760742 | 12 |
| 47.59300231933594 | 12 |
| 166.14047241210938 | 13 |
| 60.7028923034668 | 13 |
| 106.73428344726562 | 16 |
| 130.24781799316406 | 12 |
| 142.75193786621094 | 16 |
| 83.36043548583984 | 15 |
| 46.17338180541992 | 18 |
| 129.91363525390625 | 16 |
| 50.660499572753906 | 19 |
| 106.91593170166016 | 11 |
| 169.1657257080078 | 21 |
| 255.91036987304688 | 19 |
| 129.91363525390625 | 16 |
| 0.0 | 13 |
| 216.360107421875 | 19 |
| 115.9695816040039 | 22 |
| 248.3763427734375 | 18 |
| 248.3763427734375 | 21 |
| 89.6947250366211 | 21 |
| 94.3753433227539 | 21 |
| 104.75171661376953 | 22 |
| 110.10242462158203 | 20 |
| 110.10242462158203 | 20 |
| 85.00935363769531 | 17 |
| 60.01789855957031 | 15 |
| 62.35111999511719 | 13 |
| 62.35111999511719 | 11 |
| 36.52766418457031 | 15 |
| 51.193275451660156 | 17 |
| 91.69307708740234 | 9 |
| 84.83805847167969 | 21 |
| 85.00935363769531 | 16 |
| 170.4931640625 | 15 |
| 8.232808113098145 | 9 |
| 68.8892822265625 | 18 |
| 85.28121948242188 | 17 |
| 55.93062210083008 | 13 |
| 160.41050720214844 | 19 |
| 114.74307250976562 | 20 |
| 63.502445220947266 | 15 |
| 115.45804595947266 | 15 |
| 108.88775634765625 | 14 |
| 45.16642379760742 | 16 |
| 63.01080322265625 | 20 |
| 134.2421417236328 | 17 |
| 45.16642379760742 | 10 |
| 115.58369445800781 | 14 |
| 124.45266723632812 | 18 |
| 108.53717803955078 | 20 |
| 45.16642379760742 | 14 |
| 47.59300231933594 | 16 |
| 166.14047241210938 | 15 |
| 60.7028923034668 | 16 |
| 106.73428344726562 | 20 |
| 130.24781799316406 | 17 |
| 142.75193786621094 | 19 |
| 83.36043548583984 | 18 |
| 46.17338180541992 | 19 |
| 129.91363525390625 | 14 |
| 50.660499572753906 | 15 |
| 106.91593170166016 | 11 |
| 169.1657257080078 | 20 |
| 255.91036987304688 | 18 |
| 129.91363525390625 | 20 |
| 0.0 | 18 |
| 216.360107421875 | 16 |
| 115.9695816040039 | 22 |
| 0.0 | 13 |
| 291.80780029296875 | 22 |
| 291.80780029296875 | 26 |
| 76.05218505859375 | 25 |
| 85.3712158203125 | 26 |
| 58.09920883178711 | 25 |
| 57.97123336791992 | 20 |
| 57.97123336791992 | 26 |
| 153.34588623046875 | 19 |
| 126.24382781982422 | 19 |
| 31.38043212890625 | 19 |
| 31.38043212890625 | 17 |
| 68.65121459960938 | 16 |
| 119.64714050292969 | 20 |
| 160.22621154785156 | 15 |
| 153.02603149414062 | 22 |
| 153.34588623046875 | 21 |
| 93.092529296875 | 20 |
| 71.5673599243164 | 16 |
| 12.336010932922363 | 23 |
| 11.615614891052246 | 18 |
| 126.52376556396484 | 17 |
| 233.88922119140625 | 23 |
| 35.99997329711914 | 23 |
| 17.666730880737305 | 18 |
| 37.39541244506836 | 21 |
| 30.179567337036133 | 17 |
| 48.49116897583008 | 20 |
| 17.79582977294922 | 22 |
| 59.18021011352539 | 22 |
| 48.49116897583008 | 16 |
| 37.358428955078125 | 21 |
| 49.0125732421875 | 19 |
| 29.901514053344727 | 23 |
| 48.49116897583008 | 12 |
| 32.747501373291016 | 17 |
| 89.61277770996094 | 18 |
| 38.41722106933594 | 20 |
| 31.601463317871094 | 20 |
| 73.34102630615234 | 19 |
| 216.63320922851562 | 21 |
| 151.13143920898438 | 20 |
| 121.5133056640625 | 26 |
| 69.33779907226562 | 14 |
| 29.513803482055664 | 20 |
| 33.9207878112793 | 18 |
| 91.85227966308594 | 28 |
| 180.4459686279297 | 23 |
| 69.33779907226562 | 20 |
| 78.7655029296875 | 18 |
| 140.3284149169922 | 21 |
| 37.944515228271484 | 26 |
| 78.7655029296875 | 14 |
| 78.7655029296875 | 14 |
| 417.1820068359375 | 24 |
| 417.1820068359375 | 21 |
| 195.22100830078125 | 23 |
| 203.61412048339844 | 28 |
| 159.78204345703125 | 26 |
| 153.04183959960938 | 20 |
| 153.04183959960938 | 23 |
| 291.76983642578125 | 18 |
| 264.6783142089844 | 18 |
| 166.6817626953125 | 11 |
| 166.6817626953125 | 15 |
| 206.6505126953125 | 15 |
| 258.099853515625 | 16 |
| 298.6398620605469 | 18 |
| 291.4436340332031 | 16 |
| 291.76983642578125 | 13 |
| 46.41619110107422 | 20 |
| 208.10719299316406 | 18 |
| 146.14515686035156 | 13 |
| 129.7648162841797 | 15 |
| 264.9180908203125 | 12 |
| 372.2952575683594 | 16 |
| 104.57032775878906 | 10 |
| 156.00294494628906 | 20 |
| 101.34544372558594 | 15 |
| 111.46577453613281 | 13 |
| 186.1671600341797 | 16 |
| 156.19984436035156 | 21 |
| 80.15372467041016 | 11 |
| 186.1671600341797 | 16 |
| 101.55647277832031 | 15 |
| 90.10276794433594 | 16 |
| 109.56279754638672 | 15 |
| 186.1671600341797 | 14 |
| 171.08233642578125 | 17 |
| 48.8723258972168 | 18 |
| 173.00624084472656 | 20 |
| 107.94965362548828 | 20 |
| 147.00697326660156 | 14 |
| 354.9721374511719 | 18 |
| 289.5331115722656 | 19 |
| 259.14471435546875 | 17 |
| 140.16677856445312 | 18 |
| 167.8757781982422 | 19 |
| 107.44505310058594 | 17 |
| 47.42398452758789 | 16 |
| 42.00033950805664 | 15 |
| 140.16677856445312 | 17 |
| 214.35009765625 | 24 |
| 2.2961814403533936 | 21 |
| 100.77539825439453 | 20 |
| 214.35009765625 | 16 |
| 214.35009765625 | 16 |
| 138.46624755859375 | 23 |
| 248.3763427734375 | 23 |
| 248.3763427734375 | 26 |
| 89.6947250366211 | 24 |
| 94.3753433227539 | 27 |
| 104.75171661376953 | 23 |
| 110.10242462158203 | 20 |
| 110.10242462158203 | 22 |
| 85.00935363769531 | 16 |
| 60.01789855957031 | 17 |
| 62.35111999511719 | 19 |
| 62.35111999511719 | 18 |
| 36.52766418457031 | 21 |
| 51.193275451660156 | 20 |
| 91.69307708740234 | 17 |
| 84.83805847167969 | 18 |
| 85.00935363769531 | 15 |
| 170.4931640625 | 17 |
| 8.232808113098145 | 18 |
| 68.8892822265625 | 20 |
| 85.28121948242188 | 19 |
| 55.93062210083008 | 15 |
| 160.41050720214844 | 19 |
| 114.74307250976562 | 24 |
| 63.502445220947266 | 19 |
| 115.45804595947266 | 19 |
| 108.88775634765625 | 14 |
| 45.16642379760742 | 24 |
| 63.01080322265625 | 20 |
| 134.2421417236328 | 19 |
| 45.16642379760742 | 20 |
| 115.58369445800781 | 22 |
| 124.45266723632812 | 17 |
| 108.53717803955078 | 21 |
| 45.16642379760742 | 15 |
| 47.59300231933594 | 20 |
| 166.14047241210938 | 17 |
| 60.7028923034668 | 17 |
| 106.73428344726562 | 24 |
| 130.24781799316406 | 19 |
| 142.75193786621094 | 22 |
| 83.36043548583984 | 18 |
| 46.17338180541992 | 23 |
| 129.91363525390625 | 20 |
| 50.660499572753906 | 21 |
| 106.91593170166016 | 18 |
| 169.1657257080078 | 27 |
| 255.91036987304688 | 25 |
| 129.91363525390625 | 23 |
| 0.0 | 19 |
| 216.360107421875 | 21 |
| 115.9695816040039 | 23 |
| 0.0 | 16 |
| 0.0 | 17 |
| 78.7655029296875 | 19 |
| 214.35009765625 | 21 |
| 397.5975646972656 | 25 |
| 397.5975646972656 | 20 |
| 200.07350158691406 | 22 |
| 204.77784729003906 | 22 |
| 165.92776489257812 | 23 |
| 158.58444213867188 | 23 |
| 158.58444213867188 | 23 |
| 317.5546875 | 17 |
| 292.8131408691406 | 18 |
| 199.2343292236328 | 17 |
| 199.2343292236328 | 16 |
| 237.3394775390625 | 14 |
| 289.2949523925781 | 15 |
| 323.7212219238281 | 14 |
| 317.11383056640625 | 20 |
| 317.5546875 | 15 |
| 119.25849151611328 | 16 |
| 252.70379638671875 | 19 |
| 196.94464111328125 | 17 |
| 183.029296875 | 19 |
| 296.8753356933594 | 15 |
| 398.13311767578125 | 21 |
| 152.10397338867188 | 18 |
| 197.67930603027344 | 16 |
| 154.83644104003906 | 18 |
| 156.04244995117188 | 16 |
| 218.98475646972656 | 16 |
| 198.24415588378906 | 20 |
| 150.10061645507812 | 15 |
| 218.98475646972656 | 14 |
| 154.18008422851562 | 16 |
| 155.0984344482422 | 17 |
| 158.51461791992188 | 21 |
| 218.98475646972656 | 11 |
| 213.23565673828125 | 17 |
| 126.85729217529297 | 16 |
| 202.6252899169922 | 19 |
| 167.3340606689453 | 18 |
| 140.63906860351562 | 15 |
| 382.66888427734375 | 17 |
| 315.0322265625 | 16 |
| 296.91217041015625 | 17 |
| 137.52259826660156 | 18 |
| 210.28924560546875 | 19 |
| 170.27706909179688 | 15 |
| 120.58849334716797 | 19 |
| 122.2945556640625 | 19 |
| 137.52259826660156 | 19 |
| 260.6816101074219 | 20 |
| 114.14573669433594 | 19 |
| 154.5410614013672 | 20 |
| 260.6816101074219 | 15 |
| 260.6816101074219 | 14 |
| 184.9962158203125 | 14 |
| 115.58055114746094 | 17 |
| 260.6816101074219 | 20 |
| 323.0108947753906 | 23 |
| 323.0108947753906 | 17 |
| 101.66559600830078 | 22 |
| 110.87776947021484 | 19 |
| 72.19287109375 | 24 |
| 68.04553985595703 | 19 |
| 68.04553985595703 | 20 |
| 190.42800903320312 | 20 |
| 163.34454345703125 | 16 |
| 65.78799438476562 | 15 |
| 65.78799438476562 | 13 |
| 105.32362365722656 | 14 |
| 156.87994384765625 | 18 |
| 197.29383850097656 | 16 |
| 190.09938049316406 | 17 |
| 190.42800903320312 | 13 |
| 55.80388641357422 | 21 |
| 108.35308837890625 | 19 |
| 46.36664962768555 | 21 |
| 30.150434494018555 | 19 |
| 163.7932586669922 | 12 |
| 271.1438903808594 | 14 |
| 7.907927989959717 | 19 |
| 54.685943603515625 | 12 |
| 0.7655487656593323 | 10 |
| 13.070670127868652 | 17 |
| 84.87511444091797 | 15 |
| 54.906219482421875 | 19 |
| 24.069211959838867 | 13 |
| 84.87511444091797 | 11 |
| 1.8420718908309937 | 14 |
| 14.873154640197754 | 14 |
| 8.857065200805664 | 20 |
| 84.87511444091797 | 14 |
| 70.0340805053711 | 8 |
| 52.48529815673828 | 15 |
| 72.39375305175781 | 13 |
| 12.167703628540039 | 16 |
| 74.36222839355469 | 11 |
| 253.9092254638672 | 15 |
| 188.1844482421875 | 15 |
| 158.7169647216797 | 13 |
| 67.9399642944336 | 21 |
| 66.80199432373047 | 17 |
| 16.12544059753418 | 16 |
| 54.564491271972656 | 15 |
| 143.3543243408203 | 20 |
| 67.9399642944336 | 15 |
| 115.22703552246094 | 18 |
| 103.1773452758789 | 16 |
| 0.8716280460357666 | 24 |
| 115.22703552246094 | 13 |
| 115.22703552246094 | 13 |
| 37.28889465332031 | 21 |
| 101.35437774658203 | 16 |
| 115.22703552246094 | 21 |
| 155.4126739501953 | 13 |
| 83.01153564453125 | 21 |
| 83.01153564453125 | 21 |
| 139.85137939453125 | 18 |
| 131.3465576171875 | 20 |
| 175.35865783691406 | 22 |
| 182.37295532226562 | 18 |
| 182.37295532226562 | 20 |
| 106.59668731689453 | 15 |
| 117.16358184814453 | 15 |
| 177.5757598876953 | 15 |
| 177.5757598876953 | 13 |
| 148.3167266845703 | 14 |
| 125.82538604736328 | 19 |
| 104.40579986572266 | 14 |
| 106.31600952148438 | 20 |
| 106.59668731689453 | 16 |
| 289.2107238769531 | 19 |
| 169.33969116210938 | 12 |
| 208.17453002929688 | 19 |
| 220.40972900390625 | 16 |
| 125.9431381225586 | 17 |
| 129.9283905029297 | 20 |
| 234.36614990234375 | 18 |
| 192.91055297851562 | 17 |
| 239.72080993652344 | 19 |
| 227.57334899902344 | 17 |
| 163.95855712890625 | 17 |
| 193.1226043701172 | 19 |
| 264.0935363769531 | 17 |
| 163.95855712890625 | 15 |
| 239.10467529296875 | 16 |
| 254.50367736816406 | 21 |
| 231.1707305908203 | 17 |
| 163.95855712890625 | 18 |
| 183.86253356933594 | 19 |
| 288.78021240234375 | 15 |
| 170.530029296875 | 16 |
| 239.14622497558594 | 21 |
| 192.3821563720703 | 18 |
| 126.5473403930664 | 16 |
| 106.02940368652344 | 19 |
| 140.93104553222656 | 22 |
| 198.30970764160156 | 19 |
| 186.09011840820312 | 21 |
| 242.3403778076172 | 15 |
| 288.4345397949219 | 23 |
| 375.34185791015625 | 20 |
| 198.30970764160156 | 21 |
| 170.48541259765625 | 19 |
| 336.281005859375 | 21 |
| 240.28749084472656 | 19 |
| 170.48541259765625 | 15 |
| 170.48541259765625 | 13 |
| 208.91412353515625 | 18 |
| 334.96044921875 | 18 |
| 170.48541259765625 | 20 |
| 322.9372863769531 | 16 |
| 240.02505493164062 | 16 |
| 194.29905700683594 | 22 |
| 194.29905700683594 | 17 |
| 51.90515899658203 | 20 |
| 44.028568267822266 | 25 |
| 72.7109603881836 | 21 |
| 77.61920166015625 | 22 |
| 77.61920166015625 | 20 |
| 139.03604125976562 | 20 |
| 123.92179107666016 | 20 |
| 100.22972869873047 | 12 |
| 100.22972869873047 | 12 |
| 99.91484832763672 | 15 |
| 126.22447204589844 | 21 |
| 143.08518981933594 | 16 |
| 138.5380096435547 | 15 |
| 139.03604125976562 | 13 |
| 184.37744140625 | 21 |
| 129.85780334472656 | 20 |
| 130.96145629882812 | 21 |
| 136.32403564453125 | 21 |
| 132.47901916503906 | 15 |
| 209.07614135742188 | 14 |
| 137.60406494140625 | 19 |
| 115.74769592285156 | 16 |
| 144.3372802734375 | 12 |
| 131.83572387695312 | 15 |
| 100.29857635498047 | 15 |
| 116.31139373779297 | 18 |
| 167.61431884765625 | 16 |
| 100.29857635498047 | 14 |
| 143.44158935546875 | 13 |
| 159.63253784179688 | 16 |
| 136.73216247558594 | 20 |
| 100.29857635498047 | 16 |
| 116.28990936279297 | 17 |
| 185.7148895263672 | 17 |
| 94.81709289550781 | 12 |
| 148.58836364746094 | 17 |
| 80.75110626220703 | 11 |
| 196.90066528320312 | 19 |
| 136.67330932617188 | 14 |
| 141.63241577148438 | 17 |
| 87.54611206054688 | 19 |
| 116.61004638671875 | 16 |
| 152.97666931152344 | 15 |
| 183.9068603515625 | 18 |
| 265.9093322753906 | 20 |
| 87.54611206054688 | 20 |
| 136.2906494140625 | 20 |
| 228.69898986816406 | 17 |
| 144.82057189941406 | 24 |
| 136.2906494140625 | 17 |
| 136.2906494140625 | 16 |
| 125.41044616699219 | 20 |
| 227.71253967285156 | 20 |
| 136.2906494140625 | 21 |
| 205.8656005859375 | 18 |
| 144.87368774414062 | 13 |
| 117.09345245361328 | 18 |
| 329.1511535644531 | 22 |
| 329.1511535644531 | 21 |
| 107.61219787597656 | 22 |
| 116.78968811035156 | 25 |
| 77.47151184082031 | 25 |
| 73.0108871459961 | 18 |
| 73.0108871459961 | 20 |
| 196.53973388671875 | 22 |
| 169.44821166992188 | 19 |
| 72.05787658691406 | 15 |
| 72.05787658691406 | 13 |
| 111.50444030761719 | 14 |
| 162.92015075683594 | 19 |
| 203.41058349609375 | 18 |
| 196.2139129638672 | 21 |
| 196.53973388671875 | 16 |
| 49.91728210449219 | 25 |
| 114.00247192382812 | 17 |
| 51.875518798828125 | 22 |
| 35.49482345581055 | 20 |
| 169.7987823486328 | 15 |
| 277.166015625 | 16 |
| 12.578425407409668 | 19 |
| 60.7730598449707 | 18 |
| 6.4798102378845215 | 18 |
| 18.80894660949707 | 15 |
| 91.0770492553711 | 15 |
| 60.97433853149414 | 21 |
| 17.982894897460938 | 14 |
| 91.0770492553711 | 12 |
| 7.079224586486816 | 10 |
| 9.593974113464355 | 19 |
| 15.077720642089844 | 20 |
| 91.0770492553711 | 21 |
| 75.98662567138672 | 18 |
| 46.35974884033203 | 11 |
| 78.67342376708984 | 16 |
| 15.279790878295898 | 16 |
| 78.14822387695312 | 17 |
| 259.90362548828125 | 19 |
| 194.30511474609375 | 15 |
| 164.54248046875 | 18 |
| 71.5294418334961 | 18 |
| 72.76255798339844 | 22 |
| 17.862655639648438 | 17 |
| 48.64543151855469 | 16 |
| 137.2251434326172 | 22 |
| 71.5294418334961 | 14 |
| 120.76104736328125 | 15 |
| 97.0733871459961 | 20 |
| 5.9045610427856445 | 22 |
| 120.76104736328125 | 16 |
| 120.76104736328125 | 17 |
| 43.27682876586914 | 22 |
| 95.23028564453125 | 17 |
| 120.76104736328125 | 24 |
| 152.41909790039062 | 14 |
| 6.2823381423950195 | 12 |
| 246.17576599121094 | 17 |
| 150.1820526123047 | 17 |
| 36.5926513671875 | 22 |
| 36.5926513671875 | 20 |
| 251.40980529785156 | 21 |
| 243.0823211669922 | 21 |
| 287.2122497558594 | 24 |
| 294.27020263671875 | 16 |
| 294.27020263671875 | 18 |
| 187.36036682128906 | 20 |
| 208.35459899902344 | 17 |
| 286.3294982910156 | 16 |
| 286.3294982910156 | 16 |
| 252.94503784179688 | 13 |
| 217.4719696044922 | 22 |
| 181.96270751953125 | 18 |
| 187.33859252929688 | 21 |
| 187.36036682128906 | 18 |
| 400.7041931152344 | 19 |
| 268.6568298339844 | 17 |
| 315.528564453125 | 20 |
| 328.9214172363281 | 19 |
| 214.59022521972656 | 14 |
| 154.75836181640625 | 17 |
| 345.0577087402344 | 19 |
| 300.915283203125 | 18 |
| 350.10687255859375 | 18 |
| 338.1900329589844 | 17 |
| 270.73431396484375 | 17 |
| 301.0413513183594 | 18 |
| 374.3745422363281 | 16 |
| 270.73431396484375 | 15 |
| 349.54864501953125 | 16 |
| 364.5890808105469 | 19 |
| 341.5155944824219 | 18 |
| 270.73431396484375 | 19 |
| 290.1431579589844 | 20 |
| 400.0255126953125 | 13 |
| 279.333251953125 | 14 |
| 348.603759765625 | 18 |
| 304.1761169433594 | 15 |
| 164.43185424804688 | 12 |
| 188.17202758789062 | 16 |
| 228.47128295898438 | 21 |
| 310.1771545410156 | 19 |
| 292.6960754394531 | 23 |
| 351.4764404296875 | 17 |
| 399.8908996582031 | 20 |
| 487.1802978515625 | 22 |
| 310.1771545410156 | 18 |
| 267.738037109375 | 18 |
| 447.98614501953125 | 19 |
| 350.6805419921875 | 24 |
| 267.738037109375 | 17 |
| 267.738037109375 | 17 |
| 317.6567077636719 | 21 |
| 446.6300354003906 | 19 |
| 267.738037109375 | 21 |
| 431.7892761230469 | 17 |
| 350.365234375 | 15 |
| 111.93114471435547 | 15 |
| 227.1354522705078 | 15 |
| 356.584716796875 | 15 |
| 372.7870178222656 | 26 |
| 372.7870178222656 | 22 |
| 150.5540771484375 | 26 |
| 159.52879333496094 | 24 |
| 117.84756469726562 | 25 |
| 112.19429779052734 | 21 |
| 112.19429779052734 | 20 |
| 239.82205200195312 | 17 |
| 212.72018432617188 | 19 |
| 116.35371398925781 | 20 |
| 116.35371398925781 | 17 |
| 155.3010711669922 | 17 |
| 205.84005737304688 | 18 |
| 246.71543884277344 | 20 |
| 239.5135040283203 | 20 |
| 239.82205200195312 | 16 |
| 19.26022720336914 | 23 |
| 155.06842041015625 | 20 |
| 93.4202880859375 | 19 |
| 77.20673370361328 | 20 |
| 212.5045928955078 | 18 |
| 319.8078918457031 | 24 |
| 55.600250244140625 | 21 |
| 104.32876586914062 | 21 |
| 50.827781677246094 | 20 |
| 62.4736328125 | 18 |
| 135.01805114746094 | 19 |
| 104.45347595214844 | 20 |
| 27.500587463378906 | 16 |
| 135.01805114746094 | 17 |
| 51.28947448730469 | 20 |
| 37.66306686401367 | 20 |
| 59.40721130371094 | 18 |
| 135.01805114746094 | 19 |
| 118.85747528076172 | 20 |
| 11.692298889160156 | 17 |
| 123.02172088623047 | 17 |
| 55.38930892944336 | 20 |
| 111.89689636230469 | 19 |
| 302.3900451660156 | 19 |
| 237.64378356933594 | 15 |
| 206.23974609375 | 18 |
| 104.79842376708984 | 22 |
| 115.6973876953125 | 26 |
| 54.413978576660156 | 19 |
| 18.018203735351562 | 21 |
| 94.74861907958984 | 22 |
| 104.79842376708984 | 26 |
| 161.16477966308594 | 20 |
| 55.430538177490234 | 16 |
| 50.24750518798828 | 22 |
| 161.16477966308594 | 19 |
| 161.16477966308594 | 17 |
| 86.66320037841797 | 24 |
| 53.34458923339844 | 19 |
| 161.16477966308594 | 20 |
| 138.44232177734375 | 16 |
| 50.65767288208008 | 17 |
| 289.9013977050781 | 18 |
| 189.67994689941406 | 21 |
| 44.37606430053711 | 18 |
| 400.65740966796875 | 16 |
| 371.6217956542969 | 24 |
| 371.6217956542969 | 24 |
| 149.26980590820312 | 24 |
| 157.8609619140625 | 27 |
| 114.55182647705078 | 27 |
| 108.16500854492188 | 23 |
| 108.16500854492188 | 23 |
| 245.6073455810547 | 23 |
| 218.5504150390625 | 20 |
| 120.13479614257812 | 19 |
| 120.13479614257812 | 16 |
| 160.3169403076172 | 16 |
| 212.18408203125 | 15 |
| 252.45814514160156 | 15 |
| 245.27151489257812 | 23 |
| 245.6073455810547 | 20 |
| 0.9174261093139648 | 21 |
| 163.31402587890625 | 21 |
| 101.14167022705078 | 20 |
| 84.7016372680664 | 20 |
| 219.1202392578125 | 13 |
| 326.45709228515625 | 22 |
| 58.01179122924805 | 19 |
| 109.97300720214844 | 22 |
| 55.24797439575195 | 23 |
| 64.87042236328125 | 15 |
| 139.79959106445312 | 21 |
| 110.21128845214844 | 26 |
| 36.79749298095703 | 19 |
| 139.79959106445312 | 15 |
| 55.35834884643555 | 20 |
| 45.81587219238281 | 20 |
| 63.228538513183594 | 22 |
| 139.79959106445312 | 16 |
| 125.36396026611328 | 21 |
| 6.683838844299316 | 17 |
| 126.39312744140625 | 23 |
| 63.251834869384766 | 24 |
| 104.65777587890625 | 17 |
| 309.2386169433594 | 21 |
| 243.34043884277344 | 17 |
| 213.95477294921875 | 21 |
| 97.59684753417969 | 13 |
| 122.13359832763672 | 20 |
| 63.6263542175293 | 15 |
| 0.7704762816429138 | 23 |
| 88.52464294433594 | 21 |
| 97.59684753417969 | 23 |
| 169.9333953857422 | 20 |
| 48.33287811279297 | 14 |
| 54.69181823730469 | 19 |
| 169.9333953857422 | 17 |
| 169.9333953857422 | 16 |
| 92.62227630615234 | 18 |
| 46.680450439453125 | 15 |
| 169.9333953857422 | 22 |
| 120.1759033203125 | 16 |
| 55.33437728881836 | 19 |
| 289.12054443359375 | 21 |
| 184.49533081054688 | 20 |
| 49.4159049987793 | 20 |
| 400.5871276855469 | 21 |
| 18.347871780395508 | 21 |
| 59.54064178466797 | 23 |
| 59.54064178466797 | 21 |
| 163.05552673339844 | 23 |
| 154.29331970214844 | 21 |
| 197.86395263671875 | 21 |
| 204.68356323242188 | 20 |
| 204.68356323242188 | 23 |
| 129.08642578125 | 15 |
| 141.50772094726562 | 13 |
| 202.1886749267578 | 16 |
| 202.1886749267578 | 13 |
| 173.55674743652344 | 17 |
| 150.30506896972656 | 14 |
| 126.22005462646484 | 12 |
| 128.8476104736328 | 16 |
| 129.08642578125 | 15 |
| 312.1867370605469 | 16 |
| 194.59918212890625 | 14 |
| 233.0292510986328 | 18 |
| 245.00198364257812 | 19 |
| 150.03294372558594 | 15 |
| 140.96017456054688 | 18 |
| 258.09027099609375 | 21 |
| 217.66737365722656 | 17 |
| 263.60797119140625 | 15 |
| 251.35398864746094 | 15 |
| 188.9793243408203 | 19 |
| 217.89674377441406 | 20 |
| 287.9976501464844 | 14 |
| 188.9793243408203 | 10 |
| 262.9623718261719 | 13 |
| 278.5135192871094 | 16 |
| 255.09320068359375 | 21 |
| 188.9793243408203 | 15 |
| 208.9115753173828 | 17 |
| 312.01678466796875 | 15 |
| 195.14649963378906 | 16 |
| 263.4281311035156 | 18 |
| 213.52830505371094 | 13 |
| 140.4617156982422 | 14 |
| 128.7615966796875 | 16 |
| 165.01361083984375 | 20 |
| 219.7036895751953 | 15 |
| 211.09451293945312 | 19 |
| 266.7235412597656 | 14 |
| 311.4554138183594 | 17 |
| 397.6407470703125 | 20 |
| 219.7036895751953 | 20 |
| 195.65562438964844 | 17 |
| 358.90423583984375 | 19 |
| 264.17010498046875 | 20 |
| 195.65562438964844 | 13 |
| 195.65562438964844 | 9 |
| 233.46615600585938 | 18 |
| 357.6454162597656 | 15 |
| 195.65562438964844 | 19 |
| 340.583984375 | 11 |
| 263.93524169921875 | 13 |
| 25.299755096435547 | 16 |
| 135.76126098632812 | 17 |
| 270.0408020019531 | 14 |
| 91.39067077636719 | 15 |
| 313.5072326660156 | 17 |
| 312.1286926269531 | 16 |
| 397.5975646972656 | 20 |
| 397.5975646972656 | 20 |
| 200.07350158691406 | 20 |
| 204.77784729003906 | 18 |
| 165.92776489257812 | 21 |
| 158.58444213867188 | 17 |
| 158.58444213867188 | 20 |
| 317.5546875 | 19 |
| 292.8131408691406 | 14 |
| 199.2343292236328 | 16 |
| 199.2343292236328 | 13 |
| 237.3394775390625 | 14 |
| 289.2949523925781 | 13 |
| 323.7212219238281 | 10 |
| 317.11383056640625 | 20 |
| 317.5546875 | 16 |
| 119.25849151611328 | 18 |
| 252.70379638671875 | 16 |
| 196.94464111328125 | 17 |
| 183.029296875 | 17 |
| 296.8753356933594 | 11 |
| 398.13311767578125 | 18 |
| 152.10397338867188 | 18 |
| 197.67930603027344 | 15 |
| 154.83644104003906 | 15 |
| 156.04244995117188 | 15 |
| 218.98475646972656 | 17 |
| 198.24415588378906 | 20 |
| 150.10061645507812 | 13 |
| 218.98475646972656 | 13 |
| 154.18008422851562 | 14 |
| 155.0984344482422 | 16 |
| 158.51461791992188 | 18 |
| 218.98475646972656 | 12 |
| 213.23565673828125 | 14 |
| 126.85729217529297 | 15 |
| 202.6252899169922 | 17 |
| 167.3340606689453 | 17 |
| 140.63906860351562 | 12 |
| 382.66888427734375 | 11 |
| 315.0322265625 | 14 |
| 296.91217041015625 | 17 |
| 137.52259826660156 | 12 |
| 210.28924560546875 | 17 |
| 170.27706909179688 | 14 |
| 120.58849334716797 | 16 |
| 122.2945556640625 | 19 |
| 137.52259826660156 | 18 |
| 260.6816101074219 | 13 |
| 114.14573669433594 | 17 |
| 154.5410614013672 | 19 |
| 260.6816101074219 | 13 |
| 260.6816101074219 | 12 |
| 184.9962158203125 | 14 |
| 115.58055114746094 | 15 |
| 260.6816101074219 | 19 |
| 0.0 | 10 |
| 155.4126739501953 | 10 |
| 322.9372863769531 | 14 |
| 205.8656005859375 | 15 |
| 152.41909790039062 | 14 |
| 431.7892761230469 | 12 |
| 138.44232177734375 | 17 |
| 120.1759033203125 | 11 |
| 340.583984375 | 10 |
| 308.18359375 | 19 |
| 308.18359375 | 19 |
| 90.44827270507812 | 20 |
| 99.8218994140625 | 23 |
| 67.61356353759766 | 20 |
| 65.74322509765625 | 17 |
| 65.74322509765625 | 18 |
| 169.59841918945312 | 14 |
| 142.4951934814453 | 15 |
| 47.9540901184082 | 15 |
| 47.9540901184082 | 15 |
| 85.27198028564453 | 15 |
| 135.67953491210938 | 18 |
| 176.49063110351562 | 13 |
| 169.28860473632812 | 16 |
| 169.59841918945312 | 14 |
| 77.80575561523438 | 20 |
| 86.04855346679688 | 15 |
| 23.89097023010254 | 19 |
| 7.533380031585693 | 16 |
| 142.4232177734375 | 12 |
| 249.78909301757812 | 14 |
| 24.057483673095703 | 19 |
| 34.32911682128906 | 17 |
| 22.937047958374023 | 16 |
| 20.643552780151367 | 15 |
| 65.22935485839844 | 20 |
| 34.39134216308594 | 19 |
| 42.731380462646484 | 15 |
| 65.22935485839844 | 16 |
| 23.22305679321289 | 15 |
| 32.588871002197266 | 17 |
| 17.612333297729492 | 17 |
| 65.22935485839844 | 12 |
| 48.649742126464844 | 16 |
| 73.82227325439453 | 16 |
| 54.951820373535156 | 14 |
| 14.89863395690918 | 16 |
| 77.73914337158203 | 13 |
| 232.44349670410156 | 17 |
| 167.4169921875 | 12 |
| 136.7489013671875 | 16 |
| 72.53174591064453 | 15 |
| 45.477272033691406 | 17 |
| 17.195520401000977 | 15 |
| 76.50360107421875 | 19 |
| 164.44239807128906 | 16 |
| 72.53174591064453 | 17 |
| 92.77172088623047 | 14 |
| 124.44906616210938 | 17 |
| 23.409793853759766 | 21 |
| 92.77172088623047 | 15 |
| 92.77172088623047 | 14 |
| 16.790136337280273 | 20 |
| 122.5334243774414 | 16 |
| 92.77172088623047 | 16 |
| 176.12338256835938 | 16 |
| 22.62000274658203 | 14 |
| 225.23284912109375 | 15 |
| 138.07032775878906 | 16 |
| 27.989585876464844 | 16 |
| 334.28228759765625 | 17 |
| 70.2272720336914 | 16 |
| 77.27326965332031 | 19 |
| 249.6693572998047 | 14 |
| 176.12338256835938 | 13 |
| 341.25421142578125 | 20 |
| 341.25421142578125 | 19 |
| 119.7145767211914 | 22 |
| 127.89957427978516 | 25 |
| 83.8685302734375 | 23 |
| 77.06199645996094 | 21 |
| 77.06199645996094 | 23 |
| 222.96182250976562 | 16 |
| 196.23574829101562 | 15 |
| 96.99224853515625 | 15 |
| 96.99224853515625 | 13 |
| 137.751220703125 | 15 |
| 190.6920166015625 | 16 |
| 229.6956787109375 | 13 |
| 222.59075927734375 | 21 |
| 222.96182250976562 | 17 |
| 32.40378952026367 | 19 |
| 145.7451934814453 | 16 |
| 85.32530975341797 | 18 |
| 69.95964050292969 | 18 |
| 197.94921875 | 12 |
| 304.51092529296875 | 19 |
| 38.85216522216797 | 19 |
| 90.09088134765625 | 16 |
| 40.305686950683594 | 17 |
| 44.2608528137207 | 14 |
| 117.41310119628906 | 19 |
| 90.49694061279297 | 22 |
| 38.3132438659668 | 18 |
| 117.41310119628906 | 14 |
| 39.76484680175781 | 13 |
| 40.909202575683594 | 16 |
| 45.303802490234375 | 20 |
| 117.41310119628906 | 14 |
| 106.12378692626953 | 18 |
| 35.365047454833984 | 13 |
| 102.46257019042969 | 19 |
| 52.51850509643555 | 19 |
| 72.12777709960938 | 15 |
| 287.67547607421875 | 18 |
| 220.59085083007812 | 16 |
| 194.56710815429688 | 20 |
| 65.10095977783203 | 10 |
| 102.91970825195312 | 13 |
| 55.36243438720703 | 15 |
| 32.15803909301758 | 19 |
| 116.2265853881836 | 19 |
| 65.10095977783203 | 20 |
| 153.12026977539062 | 16 |
| 77.1994400024414 | 18 |
| 39.954986572265625 | 18 |
| 153.12026977539062 | 15 |
| 153.12026977539062 | 11 |
| 74.43952941894531 | 13 |
| 75.98626708984375 | 17 |
| 153.12026977539062 | 18 |
| 114.91462707519531 | 13 |
| 40.821144104003906 | 16 |
| 259.1884765625 | 17 |
| 152.34539794921875 | 15 |
| 37.505897521972656 | 17 |
| 370.98077392578125 | 19 |
| 43.22690963745117 | 20 |
| 32.65529251098633 | 11 |
| 281.7138671875 | 13 |
| 114.91462707519531 | 9 |
| 62.631683349609375 | 18 |
| 194.29905700683594 | 19 |
| 194.29905700683594 | 20 |
| 51.90515899658203 | 21 |
| 44.028568267822266 | 26 |
| 72.7109603881836 | 23 |
| 77.61920166015625 | 13 |
| 77.61920166015625 | 21 |
| 139.03604125976562 | 16 |
| 123.92179107666016 | 17 |
| 100.22972869873047 | 15 |
| 100.22972869873047 | 13 |
| 99.91484832763672 | 14 |
| 126.22447204589844 | 16 |
| 143.08518981933594 | 14 |
| 138.5380096435547 | 17 |
| 139.03604125976562 | 16 |
| 184.37744140625 | 20 |
| 129.85780334472656 | 19 |
| 130.96145629882812 | 19 |
| 136.32403564453125 | 18 |
| 132.47901916503906 | 13 |
| 209.07614135742188 | 19 |
| 137.60406494140625 | 16 |
| 115.74769592285156 | 16 |
| 144.3372802734375 | 16 |
| 131.83572387695312 | 13 |
| 100.29857635498047 | 16 |
| 116.31139373779297 | 20 |
| 167.61431884765625 | 14 |
| 100.29857635498047 | 11 |
| 143.44158935546875 | 11 |
| 159.63253784179688 | 17 |
| 136.73216247558594 | 19 |
| 100.29857635498047 | 12 |
| 116.28990936279297 | 15 |
| 185.7148895263672 | 13 |
| 94.81709289550781 | 18 |
| 148.58836364746094 | 16 |
| 80.75110626220703 | 13 |
| 196.90066528320312 | 17 |
| 136.67330932617188 | 16 |
| 141.63241577148438 | 18 |
| 87.54611206054688 | 17 |
| 116.61004638671875 | 19 |
| 152.97666931152344 | 15 |
| 183.9068603515625 | 21 |
| 265.9093322753906 | 16 |
| 87.54611206054688 | 15 |
| 136.2906494140625 | 16 |
| 228.69898986816406 | 15 |
| 144.82057189941406 | 21 |
| 136.2906494140625 | 14 |
| 136.2906494140625 | 13 |
| 125.41044616699219 | 14 |
| 227.71253967285156 | 16 |
| 136.2906494140625 | 20 |
| 205.8656005859375 | 13 |
| 144.87368774414062 | 12 |
| 117.09345245361328 | 16 |
| 0.0 | 15 |
| 150.1820526123047 | 12 |
| 227.1354522705078 | 16 |
| 189.67994689941406 | 18 |
| 184.49533081054688 | 18 |
| 135.76126098632812 | 13 |
| 205.8656005859375 | 12 |
| 138.07032775878906 | 12 |
| 152.34539794921875 | 14 |
| 281.2257080078125 | 25 |
| 281.2257080078125 | 23 |
| 70.0475845336914 | 24 |
| 79.09305572509766 | 22 |
| 59.000144958496094 | 23 |
| 60.606014251708984 | 21 |
| 60.606014251708984 | 24 |
| 139.94290161132812 | 19 |
| 112.83751678466797 | 17 |
| 21.970426559448242 | 17 |
| 21.970426559448242 | 18 |
| 55.68405532836914 | 14 |
| 106.13099670410156 | 17 |
| 146.83132934570312 | 13 |
| 139.62942504882812 | 16 |
| 139.94290161132812 | 16 |
| 106.69609069824219 | 19 |
| 58.13811111450195 | 15 |
| 10.144911766052246 | 20 |
| 23.0972843170166 | 15 |
| 112.96625518798828 | 15 |
| 220.34132385253906 | 16 |
| 49.49055862426758 | 22 |
| 5.758562088012695 | 16 |
| 51.00846481323242 | 17 |
| 43.44148635864258 | 17 |
| 35.976619720458984 | 20 |
| 5.444581508636475 | 21 |
| 72.40827178955078 | 16 |
| 35.976619720458984 | 16 |
| 50.97661590576172 | 20 |
| 62.2519416809082 | 16 |
| 43.478492736816406 | 22 |
| 35.976619720458984 | 10 |
| 19.144577026367188 | 14 |
| 103.14063262939453 | 19 |
| 28.74175262451172 | 15 |
| 44.580780029296875 | 19 |
| 78.22149658203125 | 14 |
| 203.06259155273438 | 18 |
| 137.74993896484375 | 17 |
| 107.89977264404297 | 20 |
| 75.26400756835938 | 19 |
| 15.91923713684082 | 22 |
| 46.335819244384766 | 15 |
| 105.45023345947266 | 21 |
| 193.93270874023438 | 21 |
| 75.26400756835938 | 20 |
| 65.4858169555664 | 18 |
| 153.8478240966797 | 23 |
| 51.55579376220703 | 25 |
| 65.4858169555664 | 8 |
| 65.4858169555664 | 17 |
| 13.618237495422363 | 16 |
| 151.9701385498047 | 19 |
| 65.4858169555664 | 18 |
| 196.81507873535156 | 12 |
| 50.89336395263672 | 14 |
| 198.5451202392578 | 18 |
| 121.09912109375 | 20 |
| 56.843441009521484 | 18 |
| 306.36322021484375 | 18 |
| 99.90848541259766 | 20 |
| 106.22042083740234 | 22 |
| 223.32965087890625 | 14 |
| 196.81507873535156 | 11 |
| 29.69293212890625 | 14 |
| 87.63981628417969 | 20 |
| 121.09912109375 | 16 |
| 107.46856689453125 | 25 |
| 107.46856689453125 | 21 |
| 117.48455810546875 | 24 |
| 109.42902374267578 | 21 |
| 153.71449279785156 | 25 |
| 160.94496154785156 | 18 |
| 160.94496154785156 | 23 |
| 85.28226470947266 | 21 |
| 92.97412109375 | 13 |
| 153.05364990234375 | 18 |
| 153.05364990234375 | 18 |
| 122.89082336425781 | 17 |
| 101.40135955810547 | 20 |
| 84.1418228149414 | 16 |
| 84.94413757324219 | 22 |
| 85.28226470947266 | 19 |
| 266.6048889160156 | 20 |
| 143.8277587890625 | 20 |
| 183.2827911376953 | 23 |
| 195.86109924316406 | 21 |
| 102.0749282836914 | 13 |
| 122.79594421386719 | 16 |
| 210.92672729492188 | 20 |
| 168.16741943359375 | 16 |
| 216.06385803222656 | 18 |
| 204.0742645263672 | 19 |
| 138.86563110351562 | 20 |
| 168.35520935058594 | 22 |
| 240.38031005859375 | 13 |
| 138.86563110351562 | 14 |
| 215.48635864257812 | 16 |
| 230.66946411132812 | 19 |
| 207.48257446289062 | 20 |
| 138.86563110351562 | 17 |
| 158.71412658691406 | 19 |
| 265.8577575683594 | 13 |
| 146.01473999023438 | 17 |
| 214.98329162597656 | 18 |
| 172.39697265625 | 13 |
| 116.12506103515625 | 15 |
| 84.3618392944336 | 14 |
| 117.00113677978516 | 17 |
| 177.97103881835938 | 16 |
| 161.00460815429688 | 22 |
| 218.04307556152344 | 16 |
| 265.7755126953125 | 19 |
| 353.4178466796875 | 21 |
| 177.97103881835938 | 17 |
| 145.0755615234375 | 16 |
| 314.0267639160156 | 19 |
| 216.63543701171875 | 23 |
| 145.0755615234375 | 15 |
| 145.0755615234375 | 18 |
| 184.4319610595703 | 21 |
| 312.6348876953125 | 18 |
| 145.0755615234375 | 19 |
| 306.479736328125 | 15 |
| 216.3382110595703 | 13 |
| 25.545047760009766 | 17 |
| 101.50284576416016 | 17 |
| 222.53689575195312 | 15 |
| 134.175048828125 | 11 |
| 266.5255432128906 | 19 |
| 266.4757995605469 | 16 |
| 50.843631744384766 | 14 |
| 306.479736328125 | 9 |
| 200.88487243652344 | 14 |
| 237.1949462890625 | 18 |
| 101.50284576416016 | 16 |
| 173.75796508789062 | 16 |
| 361.2976379394531 | 22 |
| 361.2976379394531 | 22 |
| 138.89501953125 | 24 |
| 147.53286743164062 | 27 |
| 104.4025650024414 | 24 |
| 98.13355255126953 | 21 |
| 98.13355255126953 | 24 |
| 235.31666564941406 | 18 |
| 208.27696228027344 | 18 |
| 109.71378326416016 | 18 |
| 109.71378326416016 | 15 |
| 149.9800262451172 | 19 |
| 201.9868621826172 | 18 |
| 242.15968322753906 | 13 |
| 234.97752380371094 | 20 |
| 235.31666564941406 | 18 |
| 10.792040824890137 | 18 |
| 153.5338897705078 | 19 |
| 91.3988037109375 | 21 |
| 74.99189758300781 | 21 |
| 208.96142578125 | 15 |
| 316.2626037597656 | 23 |
| 47.6158447265625 | 16 |
| 99.78992462158203 | 15 |
| 45.152320861816406 | 17 |
| 54.44248962402344 | 15 |
| 129.4548797607422 | 20 |
| 100.04549407958984 | 23 |
| 28.83197593688965 | 17 |
| 129.4548797607422 | 11 |
| 45.20100021362305 | 12 |
| 36.918060302734375 | 17 |
| 52.96628189086914 | 20 |
| 129.4548797607422 | 15 |
| 115.29084014892578 | 20 |
| 11.133974075317383 | 13 |
| 115.9361343383789 | 21 |
| 53.852882385253906 | 16 |
| 95.4393081665039 | 15 |
| 299.080078125 | 17 |
| 233.0394744873047 | 17 |
| 204.00094604492188 | 20 |
| 88.34595489501953 | 12 |
| 112.0548095703125 | 18 |
| 54.65273666381836 | 18 |
| 9.78914737701416 | 20 |
| 98.99928283691406 | 20 |
| 88.34595489501953 | 21 |
| 160.27297973632812 | 19 |
| 58.828304290771484 | 15 |
| 44.607215881347656 | 21 |
| 160.27297973632812 | 17 |
| 160.27297973632812 | 12 |
| 82.54520416259766 | 19 |
| 57.19300842285156 | 19 |
| 160.27297973632812 | 22 |
| 123.22936248779297 | 13 |
| 45.28471374511719 | 16 |
| 278.7442626953125 | 20 |
| 174.81410217285156 | 14 |
| 39.5316276550293 | 16 |
| 390.16180419921875 | 17 |
| 19.722925186157227 | 20 |
| 10.52019214630127 | 15 |
| 301.8203125 | 9 |
| 123.22936248779297 | 12 |
| 67.50800323486328 | 17 |
| 24.321456909179688 | 11 |
| 174.81410217285156 | 11 |
| 96.1601791381836 | 21 |
| 256.0343017578125 | 17 |
| 281.2257080078125 | 24 |
| 281.2257080078125 | 21 |
| 70.0475845336914 | 22 |
| 79.09305572509766 | 24 |
| 59.000144958496094 | 23 |
| 60.606014251708984 | 21 |
| 60.606014251708984 | 23 |
| 139.94290161132812 | 20 |
| 112.83751678466797 | 14 |
| 21.970426559448242 | 13 |
| 21.970426559448242 | 18 |
| 55.68405532836914 | 13 |
| 106.13099670410156 | 18 |
| 146.83132934570312 | 18 |
| 139.62942504882812 | 17 |
| 139.94290161132812 | 15 |
| 106.69609069824219 | 20 |
| 58.13811111450195 | 17 |
| 10.144911766052246 | 20 |
| 23.0972843170166 | 17 |
| 112.96625518798828 | 13 |
| 220.34132385253906 | 12 |
| 49.49055862426758 | 15 |
| 5.758562088012695 | 18 |
| 51.00846481323242 | 12 |
| 43.44148635864258 | 18 |
| 35.976619720458984 | 17 |
| 5.444581508636475 | 18 |
| 72.40827178955078 | 10 |
| 35.976619720458984 | 16 |
| 50.97661590576172 | 19 |
| 62.2519416809082 | 13 |
| 43.478492736816406 | 20 |
| 35.976619720458984 | 11 |
| 19.144577026367188 | 12 |
| 103.14063262939453 | 17 |
| 28.74175262451172 | 15 |
| 44.580780029296875 | 13 |
| 78.22149658203125 | 13 |
| 203.06259155273438 | 14 |
| 137.74993896484375 | 18 |
| 107.89977264404297 | 17 |
| 75.26400756835938 | 17 |
| 15.91923713684082 | 22 |
| 46.335819244384766 | 15 |
| 105.45023345947266 | 22 |
| 193.93270874023438 | 20 |
| 75.26400756835938 | 17 |
| 65.4858169555664 | 16 |
| 153.8478240966797 | 21 |
| 51.55579376220703 | 25 |
| 65.4858169555664 | 9 |
| 65.4858169555664 | 18 |
| 13.618237495422363 | 18 |
| 151.9701385498047 | 14 |
| 65.4858169555664 | 19 |
| 196.81507873535156 | 14 |
| 50.89336395263672 | 11 |
| 198.5451202392578 | 19 |
| 121.09912109375 | 16 |
| 56.843441009521484 | 17 |
| 306.36322021484375 | 16 |
| 99.90848541259766 | 20 |
| 106.22042083740234 | 19 |
| 223.32965087890625 | 16 |
| 196.81507873535156 | 12 |
| 29.69293212890625 | 16 |
| 87.63981628417969 | 18 |
| 121.09912109375 | 16 |
| 0.0 | 10 |
| 173.75796508789062 | 12 |
| 96.1601791381836 | 19 |
| 370.94586181640625 | 21 |
| 370.94586181640625 | 19 |
| 148.5832977294922 | 24 |
| 157.18319702148438 | 22 |
| 113.9012222290039 | 25 |
| 107.53022766113281 | 22 |
| 107.53022766113281 | 24 |
| 244.8411102294922 | 21 |
| 217.78363037109375 | 15 |
| 119.37660217285156 | 16 |
| 119.37660217285156 | 16 |
| 159.55288696289062 | 14 |
| 211.4153594970703 | 20 |
| 251.6921844482422 | 15 |
| 244.50540161132812 | 18 |
| 244.8411102294922 | 17 |
| 1.482221245765686 | 20 |
| 162.5447540283203 | 17 |
| 100.3724594116211 | 21 |
| 83.93260192871094 | 16 |
| 218.35084533691406 | 12 |
| 325.6882019042969 | 14 |
| 57.25260925292969 | 20 |
| 109.20433044433594 | 14 |
| 54.478580474853516 | 13 |
| 64.11371612548828 | 16 |
| 139.03602600097656 | 18 |
| 109.44229888916016 | 18 |
| 36.06285858154297 | 13 |
| 139.03602600097656 | 16 |
| 54.589900970458984 | 17 |
| 45.05929183959961 | 12 |
| 62.462501525878906 | 20 |
| 139.03602600097656 | 11 |
| 124.59381103515625 | 12 |
| 6.326123237609863 | 18 |
| 125.63880157470703 | 14 |
| 62.48673629760742 | 15 |
| 104.11554718017578 | 13 |
| 308.4691467285156 | 15 |
| 242.5745849609375 | 18 |
| 213.18435668945312 | 14 |
| 97.05036926269531 | 19 |
| 121.3635025024414 | 18 |
| 62.87062072753906 | 15 |
| 0.0 | 19 |
| 89.27816009521484 | 20 |
| 97.05036926269531 | 20 |
| 169.1657257080078 | 16 |
| 49.08271408081055 | 18 |
| 53.92230224609375 | 25 |
| 169.1657257080078 | 9 |
| 169.1657257080078 | 15 |
| 91.85227966308594 | 17 |
| 47.42398452758789 | 17 |
| 169.1657257080078 | 19 |
| 120.58849334716797 | 13 |
| 54.564491271972656 | 9 |
| 288.4345397949219 | 19 |
| 183.9068603515625 | 16 |
| 48.64543151855469 | 18 |
| 399.8908996582031 | 16 |
| 18.018203735351562 | 18 |
| 0.7704762816429138 | 20 |
| 311.4554138183594 | 13 |
| 120.58849334716797 | 10 |
| 76.50360107421875 | 15 |
| 32.15803909301758 | 16 |
| 183.9068603515625 | 15 |
| 105.45023345947266 | 10 |
| 265.7755126953125 | 13 |
| 9.78914737701416 | 17 |
| 105.45023345947266 | 7 |
| 221.69252014160156 | 21 |
| 221.69252014160156 | 19 |
| 17.422252655029297 | 20 |
| 15.72314167022705 | 25 |
| 36.421958923339844 | 23 |
| 42.733154296875 | 21 |
| 42.733154296875 | 21 |
| 131.84376525878906 | 12 |
| 110.80030059814453 | 11 |
| 62.540679931640625 | 10 |
| 62.540679931640625 | 12 |
| 71.07063293457031 | 13 |
| 110.32880401611328 | 19 |
| 137.27047729492188 | 18 |
| 131.36412048339844 | 15 |
| 131.84376525878906 | 11 |
| 150.84376525878906 | 20 |
| 99.742919921875 | 15 |
| 92.53809356689453 | 15 |
| 97.65084075927734 | 17 |
| 117.55972290039062 | 12 |
| 209.60121154785156 | 12 |
| 100.54363250732422 | 18 |
| 77.58539581298828 | 17 |
| 107.0242919921875 | 14 |
| 94.44515991210938 | 14 |
| 66.02898406982422 | 17 |
| 78.17816162109375 | 18 |
| 130.81776428222656 | 14 |
| 66.02898406982422 | 14 |
| 106.1826400756836 | 10 |
| 122.37152099609375 | 15 |
| 99.1226806640625 | 20 |
| 66.02898406982422 | 14 |
| 79.71797180175781 | 17 |
| 151.34535217285156 | 12 |
| 57.75571060180664 | 13 |
| 110.46161651611328 | 16 |
| 52.67589569091797 | 15 |
| 195.20323181152344 | 17 |
| 129.3137969970703 | 16 |
| 123.17888641357422 | 18 |
| 58.2043342590332 | 16 |
| 79.63500213623047 | 19 |
| 114.7396240234375 | 15 |
| 150.2149200439453 | 19 |
| 235.4788360595703 | 18 |
| 58.2043342590332 | 18 |
| 107.11380004882812 | 19 |
| 196.9326934814453 | 20 |
| 107.5324478149414 | 16 |
| 107.11380004882812 | 11 |
| 107.11380004882812 | 15 |
| 86.73107147216797 | 22 |
| 195.73703002929688 | 14 |
| 107.11380004882812 | 17 |
| 190.65829467773438 | 14 |
| 107.51458740234375 | 11 |
| 140.28323364257812 | 14 |
| 38.6829948425293 | 16 |
| 113.08119201660156 | 14 |
| 252.2074432373047 | 17 |
| 154.21377563476562 | 16 |
| 150.85635375976562 | 20 |
| 162.1708221435547 | 14 |
| 190.65829467773438 | 15 |
| 99.52830505371094 | 15 |
| 119.7508544921875 | 14 |
| 38.6829948425293 | 15 |
| 82.79881286621094 | 15 |
| 119.77857208251953 | 17 |
| 140.76414489746094 | 17 |
| 82.79881286621094 | 13 |
| 150.2149200439453 | 13 |
| 371.6217956542969 | 24 |
| 371.6217956542969 | 19 |
| 149.26980590820312 | 22 |
| 157.8609619140625 | 25 |
| 114.55182647705078 | 25 |
| 108.16500854492188 | 21 |
| 108.16500854492188 | 24 |
| 245.6073455810547 | 22 |
| 218.5504150390625 | 15 |
| 120.13479614257812 | 17 |
| 120.13479614257812 | 18 |
| 160.3169403076172 | 13 |
| 212.18408203125 | 20 |
| 252.45814514160156 | 17 |
| 245.27151489257812 | 22 |
| 245.6073455810547 | 19 |
| 0.9174261093139648 | 23 |
| 163.31402587890625 | 21 |
| 101.14167022705078 | 20 |
| 84.7016372680664 | 18 |
| 219.1202392578125 | 15 |
| 326.45709228515625 | 18 |
| 58.01179122924805 | 19 |
| 109.97300720214844 | 14 |
| 55.24797439575195 | 17 |
| 64.87042236328125 | 15 |
| 139.79959106445312 | 16 |
| 110.21128845214844 | 20 |
| 36.79749298095703 | 16 |
| 139.79959106445312 | 16 |
| 55.35834884643555 | 19 |
| 45.81587219238281 | 16 |
| 63.228538513183594 | 15 |
| 139.79959106445312 | 17 |
| 125.36396026611328 | 17 |
| 6.683838844299316 | 17 |
| 126.39312744140625 | 17 |
| 63.251834869384766 | 19 |
| 104.65777587890625 | 15 |
| 309.2386169433594 | 15 |
| 243.34043884277344 | 19 |
| 213.95477294921875 | 15 |
| 97.59684753417969 | 19 |
| 122.13359832763672 | 22 |
| 63.6263542175293 | 11 |
| 0.7704762816429138 | 22 |
| 88.52464294433594 | 22 |
| 97.59684753417969 | 17 |
| 169.9333953857422 | 19 |
| 48.33287811279297 | 20 |
| 54.69181823730469 | 25 |
| 169.9333953857422 | 14 |
| 169.9333953857422 | 18 |
| 92.62227630615234 | 21 |
| 46.680450439453125 | 19 |
| 169.9333953857422 | 23 |
| 120.1759033203125 | 16 |
| 55.33437728881836 | 12 |
| 289.12054443359375 | 17 |
| 184.49533081054688 | 15 |
| 49.4159049987793 | 17 |
| 400.5871276855469 | 16 |
| 18.347871780395508 | 20 |
| 0.0 | 21 |
| 312.1286926269531 | 19 |
| 120.1759033203125 | 14 |
| 77.27326965332031 | 17 |
| 32.65529251098633 | 16 |
| 184.49533081054688 | 15 |
| 106.22042083740234 | 15 |
| 266.4757995605469 | 14 |
| 10.52019214630127 | 19 |
| 106.22042083740234 | 11 |
| 0.7704762816429138 | 10 |
| 150.85635375976562 | 17 |
| 355.2670593261719 | 24 |
| 355.2670593261719 | 24 |
| 133.157958984375 | 24 |
| 142.1875 | 28 |
| 101.02889251708984 | 21 |
| 95.65730285644531 | 23 |
| 95.65730285644531 | 22 |
| 222.82325744628906 | 19 |
| 195.7181854248047 | 19 |
| 98.83321380615234 | 22 |
| 98.83321380615234 | 20 |
| 138.04306030273438 | 19 |
| 188.9888458251953 | 17 |
| 229.70811462402344 | 15 |
| 222.50682067871094 | 22 |
| 222.82325744628906 | 19 |
| 26.501304626464844 | 23 |
| 138.9110870361328 | 22 |
| 76.89350128173828 | 20 |
| 60.515716552734375 | 23 |
| 195.74801635742188 | 16 |
| 303.1136474609375 | 23 |
| 38.00228500366211 | 25 |
| 87.13581085205078 | 20 |
| 33.218997955322266 | 21 |
| 44.85414505004883 | 15 |
| 117.68586730957031 | 24 |
| 87.29019165039062 | 26 |
| 11.15339183807373 | 22 |
| 117.68586730957031 | 18 |
| 33.6616325378418 | 17 |
| 20.857500076293945 | 15 |
| 41.78570556640625 | 21 |
| 117.68586730957031 | 15 |
| 101.94845581054688 | 18 |
| 20.992891311645508 | 21 |
| 105.4623031616211 | 23 |
| 38.69794464111328 | 20 |
| 96.85697937011719 | 16 |
| 285.7601623535156 | 20 |
| 220.61895751953125 | 20 |
| 189.8977508544922 | 25 |
| 89.82001495361328 | 18 |
| 98.75871276855469 | 20 |
| 38.41945266723633 | 18 |
| 25.042207717895508 | 23 |
| 111.1221923828125 | 27 |
| 89.82001495361328 | 24 |
| 145.2718505859375 | 21 |
| 71.20179748535156 | 21 |
| 32.63823318481445 | 28 |
| 145.2718505859375 | 18 |
| 145.2718505859375 | 16 |
| 69.49874114990234 | 16 |
| 69.2525405883789 | 22 |
| 145.2718505859375 | 21 |
| 141.51223754882812 | 14 |
| 33.07023239135742 | 19 |
| 272.3555603027344 | 22 |
| 173.27024841308594 | 15 |
| 26.7891845703125 | 21 |
| 383.044189453125 | 16 |
| 17.637632369995117 | 22 |
| 25.76298713684082 | 18 |
| 296.0251159667969 | 13 |
| 141.51223754882812 | 11 |
| 53.32505416870117 | 19 |
| 33.84675216674805 | 15 |
| 173.27024841308594 | 16 |
| 82.88993835449219 | 18 |
| 248.92401123046875 | 18 |
| 18.65378761291504 | 13 |
| 82.88993835449219 | 16 |
| 25.042207717895508 | 15 |
| 137.2830047607422 | 22 |
| 25.76298713684082 | 17 |
| 484.8275451660156 | 23 |
| 484.8275451660156 | 20 |
| 264.06756591796875 | 25 |
| 272.1421813964844 | 27 |
| 227.9296875 | 28 |
| 220.8657684326172 | 24 |
| 220.8657684326172 | 23 |
| 362.38323974609375 | 25 |
| 335.2869567871094 | 24 |
| 237.26930236816406 | 16 |
| 237.26930236816406 | 13 |
| 277.28662109375 | 15 |
| 328.6499328613281 | 18 |
| 369.2566833496094 | 20 |
| 362.0590515136719 | 21 |
| 362.38323974609375 | 18 |
| 116.82534790039062 | 25 |
| 278.2014465332031 | 23 |
| 216.47152709960938 | 21 |
| 200.155517578125 | 23 |
| 335.42352294921875 | 17 |
| 442.7876892089844 | 19 |
| 175.1435089111328 | 21 |
| 226.61474609375 | 18 |
| 171.98023986816406 | 20 |
| 182.01773071289062 | 15 |
| 256.80157470703125 | 21 |
| 226.8043212890625 | 25 |
| 150.41107177734375 | 19 |
| 256.80157470703125 | 18 |
| 172.1924591064453 | 13 |
| 160.46617126464844 | 17 |
| 180.1934051513672 | 24 |
| 256.80157470703125 | 16 |
| 241.6121063232422 | 15 |
| 119.50023651123047 | 17 |
| 243.5442657470703 | 19 |
| 178.31155395507812 | 18 |
| 212.40359497070312 | 13 |
| 425.42120361328125 | 21 |
| 360.1527099609375 | 18 |
| 329.372802734375 | 19 |
| 205.93292236328125 | 19 |
| 238.41497802734375 | 17 |
| 177.5443878173828 | 21 |
| 117.9062271118164 | 16 |
| 28.64140510559082 | 22 |
| 205.93292236328125 | 21 |
| 284.2298889160156 | 22 |
| 68.8598861694336 | 20 |
| 171.40980529785156 | 23 |
| 284.2298889160156 | 17 |
| 284.2298889160156 | 19 |
| 209.052490234375 | 19 |
| 70.63612365722656 | 19 |
| 284.2298889160156 | 26 |
| 135.04598999023438 | 14 |
| 171.9854736328125 | 13 |
| 403.2383117675781 | 23 |
| 292.80438232421875 | 16 |
| 165.848388671875 | 15 |
| 515.130859375 | 20 |
| 123.13663482666016 | 18 |
| 117.15132904052734 | 18 |
| 425.3271789550781 | 19 |
| 135.04598999023438 | 13 |
| 193.0005645751953 | 21 |
| 144.37391662597656 | 12 |
| 292.80438232421875 | 15 |
| 222.52423095703125 | 19 |
| 381.5252380371094 | 21 |
| 127.61580657958984 | 17 |
| 222.52423095703125 | 18 |
| 117.9062271118164 | 14 |
| 263.16888427734375 | 17 |
| 117.15132904052734 | 18 |
| 139.67555236816406 | 19 |
| 112.0155029296875 | 27 |
| 112.0155029296875 | 25 |
| 116.41929626464844 | 26 |
| 108.80225372314453 | 28 |
| 153.02151489257812 | 30 |
| 160.38258361816406 | 23 |
| 160.38258361816406 | 27 |
| 75.82164764404297 | 24 |
| 84.58294677734375 | 19 |
| 149.55538940429688 | 20 |
| 149.55538940429688 | 21 |
| 117.69792938232422 | 19 |
| 93.18871307373047 | 21 |
| 74.53902435302734 | 21 |
| 75.49317932128906 | 26 |
| 75.82164764404297 | 24 |
| 264.85650634765625 | 20 |
| 137.32794189453125 | 23 |
| 179.1588592529297 | 27 |
| 192.22422790527344 | 24 |
| 93.48831939697266 | 18 |
| 114.49878692626953 | 18 |
| 208.52040100097656 | 24 |
| 164.30978393554688 | 17 |
| 213.42970275878906 | 23 |
| 201.62335205078125 | 22 |
| 134.48448181152344 | 23 |
| 164.46014404296875 | 28 |
| 237.64779663085938 | 19 |
| 134.48448181152344 | 21 |
| 212.8927001953125 | 19 |
| 227.8251495361328 | 21 |
| 204.83285522460938 | 24 |
| 134.48448181152344 | 15 |
| 154.16888427734375 | 22 |
| 263.83892822265625 | 18 |
| 142.5486297607422 | 23 |
| 211.79795837402344 | 24 |
| 172.7805938720703 | 18 |
| 107.20577239990234 | 20 |
| 74.9671630859375 | 22 |
| 108.46033477783203 | 22 |
| 178.1027374267578 | 20 |
| 156.58084106445312 | 22 |
| 214.6917266845703 | 20 |
| 263.9835510253906 | 23 |
| 352.115234375 | 23 |
| 178.1027374267578 | 17 |
| 138.1710968017578 | 24 |
| 312.5063781738281 | 25 |
| 214.00523376464844 | 23 |
| 138.1710968017578 | 17 |
| 138.1710968017578 | 21 |
| 180.9072265625 | 23 |
| 311.0592956542969 | 21 |
| 138.1710968017578 | 21 |
| 308.51690673828125 | 15 |
| 213.6728057861328 | 17 |
| 32.66916275024414 | 22 |
| 104.818359375 | 22 |
| 219.90948486328125 | 19 |
| 136.80654907226562 | 19 |
| 264.0911560058594 | 26 |
| 264.6949462890625 | 24 |
| 57.55474090576172 | 19 |
| 308.51690673828125 | 18 |
| 197.50042724609375 | 19 |
| 235.98736572265625 | 21 |
| 104.818359375 | 18 |
| 169.82020568847656 | 18 |
| 9.68535327911377 | 13 |
| 254.21347045898438 | 21 |
| 169.82020568847656 | 16 |
| 263.9835510253906 | 16 |
| 120.11583709716797 | 19 |
| 264.6949462890625 | 18 |
| 246.4601593017578 | 25 |
| 380.3572998046875 | 21 |
| 36.5926513671875 | 23 |
| 36.5926513671875 | 22 |
| 251.40980529785156 | 24 |
| 243.0823211669922 | 17 |
| 287.2122497558594 | 22 |
| 294.27020263671875 | 19 |
| 294.27020263671875 | 18 |
| 187.36036682128906 | 19 |
| 208.35459899902344 | 16 |
| 286.3294982910156 | 14 |
| 286.3294982910156 | 16 |
| 252.94503784179688 | 15 |
| 217.4719696044922 | 20 |
| 181.96270751953125 | 14 |
| 187.33859252929688 | 17 |
| 187.36036682128906 | 15 |
| 400.7041931152344 | 16 |
| 268.6568298339844 | 16 |
| 315.528564453125 | 17 |
| 328.9214172363281 | 16 |
| 214.59022521972656 | 16 |
| 154.75836181640625 | 13 |
| 345.0577087402344 | 22 |
| 300.915283203125 | 16 |
| 350.10687255859375 | 15 |
| 338.1900329589844 | 14 |
| 270.73431396484375 | 18 |
| 301.0413513183594 | 22 |
| 374.3745422363281 | 18 |
| 270.73431396484375 | 15 |
| 349.54864501953125 | 19 |
| 364.5890808105469 | 13 |
| 341.5155944824219 | 21 |
| 270.73431396484375 | 14 |
| 290.1431579589844 | 10 |
| 400.0255126953125 | 17 |
| 279.333251953125 | 15 |
| 348.603759765625 | 18 |
| 304.1761169433594 | 13 |
| 164.43185424804688 | 14 |
| 188.17202758789062 | 15 |
| 228.47128295898438 | 21 |
| 310.1771545410156 | 18 |
| 292.6960754394531 | 20 |
| 351.4764404296875 | 16 |
| 399.8908996582031 | 21 |
| 487.1802978515625 | 21 |
| 310.1771545410156 | 20 |
| 267.738037109375 | 18 |
| 447.98614501953125 | 19 |
| 350.6805419921875 | 25 |
| 267.738037109375 | 10 |
| 267.738037109375 | 14 |
| 317.6567077636719 | 16 |
| 446.6300354003906 | 19 |
| 267.738037109375 | 17 |
| 431.7892761230469 | 17 |
| 350.365234375 | 13 |
| 111.93114471435547 | 17 |
| 227.1354522705078 | 15 |
| 356.584716796875 | 19 |
| 0.0 | 10 |
| 400.65740966796875 | 17 |
| 400.5871276855469 | 19 |
| 91.39067077636719 | 15 |
| 431.7892761230469 | 13 |
| 334.28228759765625 | 17 |
| 370.98077392578125 | 19 |
| 227.1354522705078 | 17 |
| 306.36322021484375 | 13 |
| 134.175048828125 | 15 |
| 390.16180419921875 | 19 |
| 306.36322021484375 | 14 |
| 399.8908996582031 | 13 |
| 252.2074432373047 | 16 |
| 400.5871276855469 | 19 |
| 383.044189453125 | 15 |
| 515.130859375 | 17 |
| 136.80654907226562 | 20 |
| 291.7371826171875 | 21 |
| 291.7371826171875 | 20 |
| 88.4844970703125 | 25 |
| 92.62115478515625 | 26 |
| 57.418949127197266 | 26 |
| 51.10765075683594 | 16 |
| 51.10765075683594 | 24 |
| 207.07752990722656 | 19 |
| 183.48814392089844 | 18 |
| 99.09115600585938 | 15 |
| 99.09115600585938 | 15 |
| 131.6299285888672 | 13 |
| 181.01173400878906 | 22 |
| 212.99366760253906 | 17 |
| 206.6197967529297 | 20 |
| 207.07752990722656 | 18 |
| 102.23941040039062 | 20 |
| 152.665771484375 | 17 |
| 110.39916229248047 | 20 |
| 102.89813995361328 | 17 |
| 188.5788116455078 | 12 |
| 286.73809814453125 | 15 |
| 81.64678955078125 | 18 |
| 103.96131134033203 | 16 |
| 88.33795928955078 | 20 |
| 80.40087127685547 | 18 |
| 116.09303283691406 | 20 |
| 104.66266632080078 | 22 |
| 102.68656158447266 | 16 |
| 116.09303283691406 | 17 |
| 87.26103973388672 | 15 |
| 99.55626678466797 | 18 |
| 85.54222106933594 | 21 |
| 116.09303283691406 | 11 |
| 116.75829315185547 | 19 |
| 106.353271484375 | 15 |
| 100.19847869873047 | 18 |
| 99.49376678466797 | 19 |
| 31.04448699951172 | 16 |
| 271.70556640625 | 21 |
| 204.5388641357422 | 19 |
| 190.7052764892578 | 20 |
| 31.126476287841797 | 16 |
| 114.5073013305664 | 20 |
| 104.28362274169922 | 11 |
| 102.335205078125 | 24 |
| 173.2515106201172 | 16 |
| 31.126476287841797 | 17 |
| 160.89837646484375 | 19 |
| 139.3029022216797 | 18 |
| 88.4888687133789 | 21 |
| 160.89837646484375 | 11 |
| 160.89837646484375 | 15 |
| 98.48355102539062 | 15 |
| 138.79563903808594 | 16 |
| 160.89837646484375 | 18 |
| 112.3104476928711 | 15 |
| 89.10140991210938 | 17 |
| 213.65121459960938 | 17 |
| 97.45022583007812 | 16 |
| 91.01577758789062 | 18 |
| 324.47259521484375 | 16 |
| 114.4152603149414 | 21 |
| 102.69097137451172 | 19 |
| 233.14694213867188 | 18 |
| 112.3104476928711 | 16 |
| 98.92837524414062 | 14 |
| 71.25638580322266 | 16 |
| 97.45022583007812 | 10 |
| 105.64391326904297 | 15 |
| 195.5750274658203 | 13 |
| 95.48280334472656 | 18 |
| 105.64391326904297 | 13 |
| 102.335205078125 | 14 |
| 78.34785461425781 | 14 |
| 102.69097137451172 | 15 |
| 102.64675903320312 | 19 |
| 198.742431640625 | 19 |
| 197.00857543945312 | 14 |
| 324.47259521484375 | 16 |
| 291.7371826171875 | 22 |
| 291.7371826171875 | 24 |
| 88.4844970703125 | 24 |
| 92.62115478515625 | 23 |
| 57.418949127197266 | 26 |
| 51.10765075683594 | 19 |
| 51.10765075683594 | 20 |
| 207.07752990722656 | 19 |
| 183.48814392089844 | 19 |
| 99.09115600585938 | 20 |
| 99.09115600585938 | 18 |
| 131.6299285888672 | 17 |
| 181.01173400878906 | 16 |
| 212.99366760253906 | 18 |
| 206.6197967529297 | 23 |
| 207.07752990722656 | 20 |
| 102.23941040039062 | 22 |
| 152.665771484375 | 18 |
| 110.39916229248047 | 23 |
| 102.89813995361328 | 19 |
| 188.5788116455078 | 17 |
| 286.73809814453125 | 22 |
| 81.64678955078125 | 21 |
| 103.96131134033203 | 20 |
| 88.33795928955078 | 20 |
| 80.40087127685547 | 18 |
| 116.09303283691406 | 20 |
| 104.66266632080078 | 20 |
| 102.68656158447266 | 19 |
| 116.09303283691406 | 18 |
| 87.26103973388672 | 21 |
| 99.55626678466797 | 19 |
| 85.54222106933594 | 17 |
| 116.09303283691406 | 17 |
| 116.75829315185547 | 21 |
| 106.353271484375 | 17 |
| 100.19847869873047 | 21 |
| 99.49376678466797 | 22 |
| 31.04448699951172 | 20 |
| 271.70556640625 | 17 |
| 204.5388641357422 | 17 |
| 190.7052764892578 | 22 |
| 31.126476287841797 | 18 |
| 114.5073013305664 | 22 |
| 104.28362274169922 | 19 |
| 102.335205078125 | 23 |
| 173.2515106201172 | 22 |
| 31.126476287841797 | 22 |
| 160.89837646484375 | 18 |
| 139.3029022216797 | 18 |
| 88.4888687133789 | 15 |
| 160.89837646484375 | 19 |
| 160.89837646484375 | 16 |
| 98.48355102539062 | 21 |
| 138.79563903808594 | 21 |
| 160.89837646484375 | 15 |
| 112.3104476928711 | 19 |
| 89.10140991210938 | 18 |
| 213.65121459960938 | 18 |
| 97.45022583007812 | 21 |
| 91.01577758789062 | 20 |
| 324.47259521484375 | 17 |
| 114.4152603149414 | 15 |
| 102.69097137451172 | 19 |
| 233.14694213867188 | 19 |
| 112.3104476928711 | 13 |
| 98.92837524414062 | 17 |
| 71.25638580322266 | 14 |
| 97.45022583007812 | 18 |
| 105.64391326904297 | 22 |
| 195.5750274658203 | 19 |
| 95.48280334472656 | 19 |
| 105.64391326904297 | 21 |
| 102.335205078125 | 18 |
| 78.34785461425781 | 20 |
| 102.69097137451172 | 20 |
| 102.64675903320312 | 21 |
| 198.742431640625 | 20 |
| 197.00857543945312 | 18 |
| 324.47259521484375 | 17 |
| 0.0 | 20 |
| 309.5741882324219 | 21 |
| 309.5741882324219 | 20 |
| 88.0486831665039 | 21 |
| 97.25199890136719 | 20 |
| 58.94978713989258 | 21 |
| 55.20356369018555 | 16 |
| 55.20356369018555 | 18 |
| 179.49183654785156 | 17 |
| 152.4918670654297 | 15 |
| 53.81616973876953 | 13 |
| 53.81616973876953 | 12 |
| 94.10163116455078 | 14 |
| 146.3915252685547 | 17 |
| 186.3206024169922 | 17 |
| 179.14706420898438 | 16 |
| 179.49183654785156 | 11 |
| 66.6813735961914 | 14 |
| 99.83731842041016 | 17 |
| 39.54209899902344 | 18 |
| 25.32861328125 | 15 |
| 153.47157287597656 | 11 |
| 260.6207275390625 | 13 |
| 8.310401916503906 | 14 |
| 44.54729461669922 | 14 |
| 13.224996566772461 | 13 |
| 1.7930922508239746 | 13 |
| 73.57170867919922 | 15 |
| 44.890621185302734 | 22 |
| 37.58209228515625 | 11 |
| 73.57170867919922 | 13 |
| 12.524755477905273 | 15 |
| 28.48920440673828 | 13 |
| 5.241791248321533 | 17 |
| 73.57170867919922 | 12 |
| 60.459110260009766 | 9 |
| 64.25608825683594 | 14 |
| 60.14487075805664 | 16 |
| 18.942493438720703 | 15 |
| 63.372989654541016 | 12 |
| 243.53472900390625 | 15 |
| 177.1978759765625 | 16 |
| 149.24969482421875 | 15 |
| 57.390323638916016 | 15 |
| 57.228023529052734 | 18 |
| 23.852458953857422 | 12 |
| 65.56244659423828 | 19 |
| 154.81727600097656 | 17 |
| 57.390323638916016 | 16 |
| 107.13146209716797 | 15 |
| 114.6010971069336 | 18 |
| 13.77221393585205 | 22 |
| 107.13146209716797 | 9 |
| 107.13146209716797 | 14 |
| 28.407550811767578 | 18 |
| 112.87759399414062 | 13 |
| 107.13146209716797 | 16 |
| 157.81198120117188 | 14 |
| 13.6310396194458 | 10 |
| 226.609375 | 16 |
| 131.52806091308594 | 18 |
| 19.60323715209961 | 14 |
| 337.13299560546875 | 18 |
| 63.57199478149414 | 18 |
| 66.32140350341797 | 19 |
| 250.44483947753906 | 14 |
| 157.81198120117188 | 13 |
| 19.014156341552734 | 11 |
| 46.032249450683594 | 16 |
| 131.52806091308594 | 10 |
| 41.69948959350586 | 11 |
| 203.04147338867188 | 14 |
| 55.918941497802734 | 16 |
| 41.69948959350586 | 9 |
| 65.56244659423828 | 12 |
| 93.9861831665039 | 13 |
| 66.32140350341797 | 14 |
| 45.937461853027344 | 20 |
| 183.45375061035156 | 17 |
| 200.52383422851562 | 16 |
| 337.13299560546875 | 14 |
| 81.49604034423828 | 12 |
| 81.49604034423828 | 18 |
| 254.82083129882812 | 26 |
| 254.82083129882812 | 23 |
| 56.16276550292969 | 26 |
| 63.7098388671875 | 26 |
| 61.747249603271484 | 23 |
| 66.48383331298828 | 24 |
| 66.48383331298828 | 25 |
| 111.7459487915039 | 22 |
| 84.66047668457031 | 20 |
| 18.1116886138916 | 19 |
| 18.1116886138916 | 20 |
| 27.15076446533203 | 17 |
| 78.3289794921875 | 21 |
| 118.6152572631836 | 18 |
| 111.41903686523438 | 17 |
| 111.7459487915039 | 16 |
| 134.3446044921875 | 26 |
| 36.05662536621094 | 20 |
| 36.736236572265625 | 25 |
| 51.62295913696289 | 22 |
| 85.38699340820312 | 19 |
| 192.59381103515625 | 15 |
| 76.2701187133789 | 22 |
| 24.0372314453125 | 19 |
| 78.71876525878906 | 12 |
| 69.70420837402344 | 20 |
| 8.822864532470703 | 21 |
| 23.879140853881836 | 20 |
| 100.83045959472656 | 16 |
| 8.822864532470703 | 17 |
| 78.56587219238281 | 19 |
| 90.66361999511719 | 18 |
| 70.714111328125 | 25 |
| 8.822864532470703 | 15 |
| 11.234526634216309 | 13 |
| 131.15255737304688 | 17 |
| 17.199451446533203 | 15 |
| 73.08463287353516 | 11 |
| 86.49994659423828 | 14 |
| 175.463623046875 | 17 |
| 109.50977325439453 | 17 |
| 81.72425079345703 | 19 |
| 85.81671142578125 | 21 |
| 13.663517951965332 | 22 |
| 74.87142944335938 | 21 |
| 133.1480712890625 | 23 |
| 222.02059936523438 | 25 |
| 85.81671142578125 | 21 |
| 44.25510025024414 | 18 |
| 181.85858154296875 | 19 |
| 79.28377532958984 | 30 |
| 44.25510025024414 | 13 |
| 44.25510025024414 | 19 |
| 41.674766540527344 | 19 |
| 180.02464294433594 | 25 |
| 44.25510025024414 | 24 |
| 217.1333465576172 | 17 |
| 78.6841049194336 | 12 |
| 172.62814331054688 | 24 |
| 107.7191162109375 | 13 |
| 84.79549407958984 | 18 |
| 279.03521728515625 | 20 |
| 128.32440185546875 | 21 |
| 133.91571044921875 | 25 |
| 197.68019104003906 | 18 |
| 217.1333465576172 | 15 |
| 58.18617248535156 | 18 |
| 112.91246032714844 | 19 |
| 107.7191162109375 | 15 |
| 28.544883728027344 | 15 |
| 147.48236083984375 | 20 |
| 123.68038940429688 | 16 |
| 28.544883728027344 | 12 |
| 133.1480712890625 | 12 |
| 72.36056518554688 | 17 |
| 133.91571044921875 | 18 |
| 111.1676254272461 | 17 |
| 250.6429901123047 | 14 |
| 142.96937561035156 | 23 |
| 279.03521728515625 | 15 |
| 116.88584899902344 | 17 |
| 116.88584899902344 | 21 |
| 68.0845947265625 | 16 |
| 325.8387756347656 | 23 |
| 325.8387756347656 | 22 |
| 105.62772369384766 | 18 |
| 114.93716430664062 | 22 |
| 77.95806121826172 | 18 |
| 74.337646484375 | 25 |
| 74.337646484375 | 28 |
| 189.57928466796875 | 21 |
| 162.47457885742188 | 21 |
| 66.73179626464844 | 24 |
| 66.73179626464844 | 23 |
| 105.06475830078125 | 20 |
| 155.6796112060547 | 20 |
| 196.46954345703125 | 17 |
| 189.26751708984375 | 23 |
| 189.57928466796875 | 22 |
| 58.245609283447266 | 24 |
| 105.752197265625 | 22 |
| 43.624412536621094 | 23 |
| 27.205787658691406 | 23 |
| 162.41998291015625 | 19 |
| 269.7818603515625 | 23 |
| 15.860883712768555 | 25 |
| 54.07882308959961 | 23 |
| 9.197019577026367 | 23 |
| 19.250741958618164 | 20 |
| 84.86063385009766 | 25 |
| 54.190731048583984 | 21 |
| 22.77692985534668 | 22 |
| 84.86063385009766 | 20 |
| 10.244771957397461 | 22 |
| 12.612165451049805 | 21 |
| 13.907626152038574 | 26 |
| 84.86063385009766 | 14 |
| 68.64666748046875 | 20 |
| 53.94809341430664 | 23 |
| 73.58406829833984 | 25 |
| 5.63578462600708 | 21 |
| 81.86758422851562 | 18 |
| 252.42649841308594 | 23 |
| 187.3909149169922 | 22 |
| 156.62461853027344 | 27 |
| 75.60307312011719 | 20 |
| 65.4686050415039 | 19 |
| 8.07498836517334 | 21 |
| 56.902610778808594 | 27 |
| 144.45587158203125 | 26 |
| 75.60307312011719 | 23 |
| 112.28137969970703 | 24 |
| 104.49836730957031 | 23 |
| 9.15462589263916 | 24 |
| 112.28137969970703 | 19 |
| 112.28137969970703 | 18 |
| 36.41359329223633 | 18 |
| 102.56832885742188 | 21 |
| 112.28137969970703 | 24 |
| 162.30825805664062 | 15 |
| 8.434183120727539 | 20 |
| 242.82777404785156 | 22 |
| 150.38507080078125 | 23 |
| 9.924345970153809 | 22 |
| 352.60614013671875 | 24 |
| 50.27510070800781 | 25 |
| 57.66880798339844 | 22 |
| 266.9847106933594 | 16 |
| 162.30825805664062 | 16 |
| 20.00029945373535 | 15 |
| 47.40553665161133 | 20 |
| 150.38507080078125 | 15 |
| 49.64243698120117 | 16 |
| 218.82113647460938 | 23 |
| 48.22487258911133 | 19 |
| 49.64243698120117 | 19 |
| 56.902610778808594 | 18 |
| 112.55804443359375 | 22 |
| 57.66880798339844 | 21 |
| 33.33373260498047 | 16 |
| 173.00592041015625 | 23 |
| 215.80816650390625 | 24 |
| 352.60614013671875 | 22 |
| 97.43501281738281 | 19 |
| 97.43501281738281 | 25 |
| 19.136159896850586 | 18 |
| 78.05390930175781 | 21 |
| 59.12030029296875 | 24 |
| 59.12030029296875 | 20 |
| 164.20616149902344 | 24 |
| 155.3392791748047 | 25 |
| 198.65109252929688 | 27 |
| 205.38027954101562 | 21 |
| 205.38027954101562 | 24 |
| 133.633544921875 | 21 |
| 145.4910888671875 | 17 |
| 204.13316345214844 | 10 |
| 204.13316345214844 | 16 |
| 176.25071716308594 | 12 |
| 154.22511291503906 | 18 |
| 130.89784240722656 | 17 |
| 133.3854217529297 | 17 |
| 133.633544921875 | 15 |
| 313.1044921875 | 20 |
| 197.79978942871094 | 17 |
| 235.16812133789062 | 13 |
| 246.90602111816406 | 17 |
| 154.12899780273438 | 14 |
| 146.29632568359375 | 13 |
| 259.4199523925781 | 14 |
| 219.72286987304688 | 16 |
| 265.0281677246094 | 15 |
| 252.71934509277344 | 13 |
| 191.31809997558594 | 13 |
| 219.96759033203125 | 18 |
| 289.4164123535156 | 10 |
| 191.31809997558594 | 15 |
| 264.3656311035156 | 16 |
| 280.0002136230469 | 14 |
| 256.5387268066406 | 18 |
| 191.31809997558594 | 14 |
| 211.2744598388672 | 16 |
| 313.062255859375 | 16 |
| 197.09877014160156 | 18 |
| 265.0968322753906 | 15 |
| 213.76126098632812 | 13 |
| 145.7864227294922 | 15 |
| 133.2541046142578 | 18 |
| 169.1177215576172 | 14 |
| 220.02133178710938 | 17 |
| 213.40231323242188 | 22 |
| 268.4610900878906 | 14 |
| 312.39501953125 | 22 |
| 398.22088623046875 | 18 |
| 220.02133178710938 | 19 |
| 199.03065490722656 | 22 |
| 359.63995361328125 | 19 |
| 265.5873107910156 | 23 |
| 199.03065490722656 | 14 |
| 199.03065490722656 | 17 |
| 235.34442138671875 | 20 |
| 358.4095764160156 | 10 |
| 199.03065490722656 | 22 |
| 339.5998840332031 | 15 |
| 265.36883544921875 | 16 |
| 28.574182510375977 | 18 |
| 135.34996032714844 | 20 |
| 271.4447937011719 | 17 |
| 92.18943786621094 | 15 |
| 314.74566650390625 | 18 |
| 313.0618591308594 | 18 |
| 5.341431140899658 | 18 |
| 339.5998840332031 | 15 |
| 251.4530029296875 | 17 |
| 282.4405822753906 | 17 |
| 135.34996032714844 | 15 |
| 225.40707397460938 | 15 |
| 53.98031234741211 | 14 |
| 302.7909240722656 | 20 |
| 225.40707397460938 | 10 |
| 312.39501953125 | 13 |
| 162.75955200195312 | 16 |
| 313.0618591308594 | 12 |
| 297.3058776855469 | 22 |
| 425.8102111816406 | 15 |
| 61.18948745727539 | 17 |
| 92.18943786621094 | 15 |
| 232.79818725585938 | 12 |
| 232.79818725585938 | 20 |
| 251.84210205078125 | 10 |
| 200.05238342285156 | 20 |
| 268.5691223144531 | 22 |
| 319.9702453613281 | 23 |
| 319.9702453613281 | 18 |
| 99.03754425048828 | 24 |
| 106.97673034667969 | 23 |
| 62.751304626464844 | 27 |
| 55.75790023803711 | 20 |
| 55.75790023803711 | 24 |
| 205.87310791015625 | 23 |
| 179.5098419189453 | 19 |
| 81.14058685302734 | 17 |
| 81.14058685302734 | 15 |
| 121.4464340209961 | 15 |
| 174.53201293945312 | 17 |
| 212.5030517578125 | 16 |
| 205.48226928710938 | 20 |
| 205.87310791015625 | 18 |
| 53.74159622192383 | 22 |
| 132.78298950195312 | 17 |
| 75.8237533569336 | 19 |
| 62.60997009277344 | 16 |
| 181.93954467773438 | 15 |
| 287.53985595703125 | 20 |
| 33.265968322753906 | 19 |
| 77.08613586425781 | 14 |
| 38.31691360473633 | 19 |
| 35.62225341796875 | 16 |
| 101.59805297851562 | 16 |
| 77.60621643066406 | 20 |
| 48.6292610168457 | 14 |
| 101.59805297851562 | 14 |
| 37.359169006347656 | 16 |
| 46.529510498046875 | 16 |
| 39.115135192871094 | 20 |
| 101.59805297851562 | 16 |
| 92.96074676513672 | 19 |
| 55.852027893066406 | 16 |
| 85.85284423828125 | 18 |
| 50.97822570800781 | 17 |
| 50.75899887084961 | 16 |
| 270.9818115234375 | 15 |
| 203.4501953125 | 18 |
| 179.7391815185547 | 15 |
| 43.68612289428711 | 17 |
| 89.89163970947266 | 20 |
| 55.17538833618164 | 14 |
| 53.36609649658203 | 21 |
| 137.25685119628906 | 18 |
| 43.68612289428711 | 19 |
| 140.54864501953125 | 18 |
| 98.61483001708984 | 15 |
| 38.263545989990234 | 23 |
| 140.54864501953125 | 15 |
| 140.54864501953125 | 16 |
| 63.819358825683594 | 18 |
| 97.45999908447266 | 19 |
| 140.54864501953125 | 22 |
| 121.17849731445312 | 13 |
| 39.05223083496094 | 14 |
| 238.09478759765625 | 15 |
| 130.7606658935547 | 18 |
| 39.07561111450195 | 15 |
| 349.9622802734375 | 15 |
| 62.00008773803711 | 13 |
| 53.91680145263672 | 19 |
| 260.4320983886719 | 17 |
| 121.17849731445312 | 13 |
| 56.23640823364258 | 17 |
| 21.599342346191406 | 15 |
| 130.7606658935547 | 13 |
| 75.80193328857422 | 16 |
| 216.39329528808594 | 14 |
| 44.73439407348633 | 17 |
| 75.80193328857422 | 14 |
| 53.36609649658203 | 11 |
| 98.34185028076172 | 16 |
| 53.91680145263672 | 11 |
| 48.720149993896484 | 20 |
| 165.18002319335938 | 11 |
| 215.45225524902344 | 18 |
| 349.9622802734375 | 16 |
| 54.167236328125 | 13 |
| 54.167236328125 | 17 |
| 37.31459045410156 | 14 |
| 98.22180938720703 | 17 |
| 47.35969161987305 | 22 |
| 261.09075927734375 | 8 |
| 355.2670593261719 | 21 |
| 355.2670593261719 | 25 |
| 133.157958984375 | 24 |
| 142.1875 | 27 |
| 101.02889251708984 | 26 |
| 95.65730285644531 | 24 |
| 95.65730285644531 | 30 |
| 222.82325744628906 | 20 |
| 195.7181854248047 | 19 |
| 98.83321380615234 | 20 |
| 98.83321380615234 | 19 |
| 138.04306030273438 | 23 |
| 188.9888458251953 | 27 |
| 229.70811462402344 | 20 |
| 222.50682067871094 | 26 |
| 222.82325744628906 | 25 |
| 26.501304626464844 | 24 |
| 138.9110870361328 | 19 |
| 76.89350128173828 | 26 |
| 60.515716552734375 | 20 |
| 195.74801635742188 | 18 |
| 303.1136474609375 | 25 |
| 38.00228500366211 | 25 |
| 87.13581085205078 | 24 |
| 33.218997955322266 | 21 |
| 44.85414505004883 | 20 |
| 117.68586730957031 | 23 |
| 87.29019165039062 | 25 |
| 11.15339183807373 | 24 |
| 117.68586730957031 | 18 |
| 33.6616325378418 | 22 |
| 20.857500076293945 | 19 |
| 41.78570556640625 | 20 |
| 117.68586730957031 | 22 |
| 101.94845581054688 | 23 |
| 20.992891311645508 | 19 |
| 105.4623031616211 | 24 |
| 38.69794464111328 | 23 |
| 96.85697937011719 | 23 |
| 285.7601623535156 | 24 |
| 220.61895751953125 | 24 |
| 189.8977508544922 | 29 |
| 89.82001495361328 | 21 |
| 98.75871276855469 | 25 |
| 38.41945266723633 | 23 |
| 25.042207717895508 | 27 |
| 111.1221923828125 | 26 |
| 89.82001495361328 | 28 |
| 145.2718505859375 | 20 |
| 71.20179748535156 | 23 |
| 32.63823318481445 | 28 |
| 145.2718505859375 | 17 |
| 145.2718505859375 | 16 |
| 69.49874114990234 | 19 |
| 69.2525405883789 | 25 |
| 145.2718505859375 | 23 |
| 141.51223754882812 | 27 |
| 33.07023239135742 | 23 |
| 272.3555603027344 | 20 |
| 173.27024841308594 | 23 |
| 26.7891845703125 | 26 |
| 383.044189453125 | 25 |
| 17.637632369995117 | 28 |
| 25.76298713684082 | 25 |
| 296.0251159667969 | 21 |
| 141.51223754882812 | 20 |
| 53.32505416870117 | 23 |
| 33.84675216674805 | 17 |
| 173.27024841308594 | 18 |
| 82.88993835449219 | 25 |
| 248.92401123046875 | 26 |
| 18.65378761291504 | 20 |
| 82.88993835449219 | 23 |
| 25.042207717895508 | 20 |
| 137.2830047607422 | 19 |
| 25.76298713684082 | 25 |
| 0.0 | 26 |
| 139.67555236816406 | 28 |
| 246.4601593017578 | 30 |
| 383.044189453125 | 22 |
| 102.64675903320312 | 23 |
| 102.64675903320312 | 24 |
| 45.937461853027344 | 20 |
| 111.1676254272461 | 27 |
| 33.33373260498047 | 22 |
| 297.3058776855469 | 25 |
| 48.720149993896484 | 25 |
| 237.624755859375 | 20 |
| 237.624755859375 | 18 |
| 48.33578109741211 | 19 |
| 54.12266540527344 | 22 |
| 64.37007141113281 | 22 |
| 70.47074890136719 | 18 |
| 70.47074890136719 | 18 |
| 96.85391235351562 | 20 |
| 70.00826263427734 | 19 |
| 29.267560958862305 | 12 |
| 29.267560958862305 | 11 |
| 11.52391529083252 | 13 |
| 64.60830688476562 | 16 |
| 103.64585876464844 | 16 |
| 96.49658203125 | 17 |
| 96.85391235351562 | 13 |
| 149.43283081054688 | 17 |
| 34.297943115234375 | 15 |
| 53.91374206542969 | 19 |
| 68.35260772705078 | 15 |
| 71.99302673339844 | 13 |
| 178.2896728515625 | 15 |
| 91.07234954833984 | 16 |
| 40.28866195678711 | 14 |
| 94.17467498779297 | 16 |
| 84.29159545898438 | 15 |
| 9.386540412902832 | 15 |
| 40.26139831542969 | 21 |
| 116.96914672851562 | 15 |
| 9.386540412902832 | 12 |
| 93.92481231689453 | 15 |
| 106.81196594238281 | 16 |
| 85.90245819091797 | 16 |
| 9.386540412902832 | 16 |
| 28.441810607910156 | 17 |
| 146.64158630371094 | 15 |
| 24.108131408691406 | 14 |
| 89.4725570678711 | 19 |
| 90.55378723144531 | 15 |
| 161.43792724609375 | 17 |
| 94.52399444580078 | 16 |
| 70.65626525878906 | 18 |
| 91.20536041259766 | 14 |
| 30.938711166381836 | 18 |
| 91.5368423461914 | 10 |
| 148.29029846191406 | 18 |
| 237.45437622070312 | 15 |
| 91.20536041259766 | 16 |
| 42.022735595703125 | 20 |
| 197.24017333984375 | 18 |
| 94.74946594238281 | 20 |
| 42.022735595703125 | 13 |
| 42.022735595703125 | 13 |
| 57.87685775756836 | 21 |
| 195.465087890625 | 14 |
| 42.022735595703125 | 18 |
| 226.26219177246094 | 14 |
| 94.20807647705078 | 13 |
| 155.56451416015625 | 14 |
| 97.63196563720703 | 13 |
| 100.42000579833984 | 13 |
| 261.7575378417969 | 15 |
| 144.39556884765625 | 19 |
| 149.0526885986328 | 16 |
| 180.6709442138672 | 12 |
| 226.26219177246094 | 15 |
| 74.60990905761719 | 13 |
| 126.2405776977539 | 17 |
| 97.63196563720703 | 15 |
| 45.28669738769531 | 15 |
| 130.3483123779297 | 15 |
| 138.68614196777344 | 14 |
| 45.28669738769531 | 12 |
| 148.29029846191406 | 16 |
| 65.64324188232422 | 14 |
| 149.0526885986328 | 14 |
| 127.05033874511719 | 19 |
| 266.0954895019531 | 19 |
| 125.72940063476562 | 16 |
| 261.7575378417969 | 16 |
| 121.56904602050781 | 12 |
| 121.56904602050781 | 20 |
| 82.77674865722656 | 11 |
| 17.278371810913086 | 20 |
| 94.2464370727539 | 21 |
| 183.1245880126953 | 14 |
| 109.94829559326172 | 15 |
| 127.05033874511719 | 25 |
| 36.5926513671875 | 24 |
| 36.5926513671875 | 23 |
| 251.40980529785156 | 23 |
| 243.0823211669922 | 22 |
| 287.2122497558594 | 24 |
| 294.27020263671875 | 19 |
| 294.27020263671875 | 25 |
| 187.36036682128906 | 19 |
| 208.35459899902344 | 16 |
| 286.3294982910156 | 17 |
| 286.3294982910156 | 14 |
| 252.94503784179688 | 14 |
| 217.4719696044922 | 20 |
| 181.96270751953125 | 16 |
| 187.33859252929688 | 21 |
| 187.36036682128906 | 20 |
| 400.7041931152344 | 23 |
| 268.6568298339844 | 18 |
| 315.528564453125 | 16 |
| 328.9214172363281 | 15 |
| 214.59022521972656 | 14 |
| 154.75836181640625 | 20 |
| 345.0577087402344 | 19 |
| 300.915283203125 | 19 |
| 350.10687255859375 | 19 |
| 338.1900329589844 | 17 |
| 270.73431396484375 | 18 |
| 301.0413513183594 | 20 |
| 374.3745422363281 | 18 |
| 270.73431396484375 | 18 |
| 349.54864501953125 | 20 |
| 364.5890808105469 | 19 |
| 341.5155944824219 | 18 |
| 270.73431396484375 | 16 |
| 290.1431579589844 | 17 |
| 400.0255126953125 | 16 |
| 279.333251953125 | 19 |
| 348.603759765625 | 21 |
| 304.1761169433594 | 18 |
| 164.43185424804688 | 17 |
| 188.17202758789062 | 20 |
| 228.47128295898438 | 20 |
| 310.1771545410156 | 21 |
| 292.6960754394531 | 22 |
| 351.4764404296875 | 16 |
| 399.8908996582031 | 21 |
| 487.1802978515625 | 19 |
| 310.1771545410156 | 22 |
| 267.738037109375 | 18 |
| 447.98614501953125 | 21 |
| 350.6805419921875 | 21 |
| 267.738037109375 | 15 |
| 267.738037109375 | 15 |
| 317.6567077636719 | 16 |
| 446.6300354003906 | 18 |
| 267.738037109375 | 22 |
| 431.7892761230469 | 13 |
| 350.365234375 | 14 |
| 111.93114471435547 | 14 |
| 227.1354522705078 | 22 |
| 356.584716796875 | 21 |
| 0.0 | 18 |
| 400.65740966796875 | 18 |
| 400.5871276855469 | 20 |
| 91.39067077636719 | 15 |
| 431.7892761230469 | 12 |
| 334.28228759765625 | 16 |
| 370.98077392578125 | 13 |
| 227.1354522705078 | 13 |
| 306.36322021484375 | 18 |
| 134.175048828125 | 20 |
| 390.16180419921875 | 18 |
| 306.36322021484375 | 18 |
| 399.8908996582031 | 13 |
| 252.2074432373047 | 15 |
| 400.5871276855469 | 16 |
| 383.044189453125 | 21 |
| 515.130859375 | 17 |
| 136.80654907226562 | 21 |
| 0.0 | 19 |
| 324.47259521484375 | 16 |
| 324.47259521484375 | 16 |
| 337.13299560546875 | 14 |
| 279.03521728515625 | 21 |
| 352.60614013671875 | 21 |
| 92.18943786621094 | 15 |
| 349.9622802734375 | 14 |
| 383.044189453125 | 19 |
| 261.7575378417969 | 18 |
| 397.5975646972656 | 21 |
| 397.5975646972656 | 19 |
| 200.07350158691406 | 20 |
| 204.77784729003906 | 25 |
| 165.92776489257812 | 21 |
| 158.58444213867188 | 21 |
| 158.58444213867188 | 21 |
| 317.5546875 | 16 |
| 292.8131408691406 | 17 |
| 199.2343292236328 | 16 |
| 199.2343292236328 | 15 |
| 237.3394775390625 | 13 |
| 289.2949523925781 | 18 |
| 323.7212219238281 | 13 |
| 317.11383056640625 | 20 |
| 317.5546875 | 18 |
| 119.25849151611328 | 18 |
| 252.70379638671875 | 15 |
| 196.94464111328125 | 19 |
| 183.029296875 | 17 |
| 296.8753356933594 | 13 |
| 398.13311767578125 | 19 |
| 152.10397338867188 | 20 |
| 197.67930603027344 | 17 |
| 154.83644104003906 | 17 |
| 156.04244995117188 | 13 |
| 218.98475646972656 | 19 |
| 198.24415588378906 | 19 |
| 150.10061645507812 | 19 |
| 218.98475646972656 | 14 |
| 154.18008422851562 | 17 |
| 155.0984344482422 | 12 |
| 158.51461791992188 | 16 |
| 218.98475646972656 | 13 |
| 213.23565673828125 | 19 |
| 126.85729217529297 | 15 |
| 202.6252899169922 | 16 |
| 167.3340606689453 | 17 |
| 140.63906860351562 | 13 |
| 382.66888427734375 | 17 |
| 315.0322265625 | 16 |
| 296.91217041015625 | 23 |
| 137.52259826660156 | 15 |
| 210.28924560546875 | 17 |
| 170.27706909179688 | 14 |
| 120.58849334716797 | 19 |
| 122.2945556640625 | 21 |
| 137.52259826660156 | 18 |
| 260.6816101074219 | 21 |
| 114.14573669433594 | 18 |
| 154.5410614013672 | 24 |
| 260.6816101074219 | 16 |
| 260.6816101074219 | 11 |
| 184.9962158203125 | 15 |
| 115.58055114746094 | 16 |
| 260.6816101074219 | 18 |
| 0.0 | 12 |
| 155.4126739501953 | 16 |
| 322.9372863769531 | 16 |
| 205.8656005859375 | 12 |
| 152.41909790039062 | 18 |
| 431.7892761230469 | 13 |
| 138.44232177734375 | 18 |
| 120.1759033203125 | 17 |
| 340.583984375 | 12 |
| 0.0 | 12 |
| 176.12338256835938 | 14 |
| 114.91462707519531 | 11 |
| 205.8656005859375 | 16 |
| 196.81507873535156 | 17 |
| 306.479736328125 | 16 |
| 123.22936248779297 | 13 |
| 196.81507873535156 | 14 |
| 120.58849334716797 | 15 |
| 190.65829467773438 | 18 |
| 120.1759033203125 | 14 |
| 141.51223754882812 | 10 |
| 135.04598999023438 | 18 |
| 308.51690673828125 | 20 |
| 431.7892761230469 | 16 |
| 112.3104476928711 | 15 |
| 112.3104476928711 | 15 |
| 157.81198120117188 | 16 |
| 217.1333465576172 | 17 |
| 162.30825805664062 | 16 |
| 339.5998840332031 | 15 |
| 121.17849731445312 | 16 |
| 141.51223754882812 | 22 |
| 226.26219177246094 | 13 |
| 431.7892761230469 | 16 |
| 227.77352905273438 | 22 |
| 227.77352905273438 | 23 |
| 59.17378234863281 | 21 |
| 56.04652786254883 | 25 |
| 59.64169692993164 | 20 |
| 61.31602096557617 | 17 |
| 61.31602096557617 | 22 |
| 167.55999755859375 | 17 |
| 149.09048461914062 | 17 |
| 99.6147689819336 | 15 |
| 99.6147689819336 | 14 |
| 112.84237670898438 | 15 |
| 149.70947265625 | 20 |
| 172.30311584472656 | 14 |
| 167.06593322753906 | 19 |
| 167.55999755859375 | 19 |
| 159.8708953857422 | 23 |
| 141.3324737548828 | 18 |
| 126.01667785644531 | 23 |
| 127.09938049316406 | 17 |
| 156.64776611328125 | 15 |
| 241.27587890625 | 16 |
| 120.57716369628906 | 18 |
| 112.73662567138672 | 20 |
| 127.72456359863281 | 17 |
| 115.93318939208984 | 16 |
| 106.65555572509766 | 20 |
| 113.4102554321289 | 21 |
| 148.98635864257812 | 19 |
| 106.65555572509766 | 17 |
| 126.71269226074219 | 20 |
| 142.39112854003906 | 16 |
| 121.27940368652344 | 15 |
| 106.65555572509766 | 14 |
| 118.08206176757812 | 16 |
| 162.3106689453125 | 16 |
| 96.15550231933594 | 18 |
| 134.62261962890625 | 18 |
| 56.02475357055664 | 15 |
| 228.2317352294922 | 18 |
| 165.09156799316406 | 18 |
| 163.52328491210938 | 23 |
| 63.11772918701172 | 18 |
| 117.42854309082031 | 21 |
| 139.39596557617188 | 17 |
| 159.6134033203125 | 23 |
| 237.18304443359375 | 22 |
| 63.11772918701172 | 21 |
| 148.7995147705078 | 20 |
| 201.5413818359375 | 19 |
| 128.12210083007812 | 25 |
| 148.7995147705078 | 13 |
| 148.7995147705078 | 18 |
| 117.65138244628906 | 15 |
| 200.77890014648438 | 21 |
| 148.7995147705078 | 19 |
| 170.918701171875 | 19 |
| 128.37103271484375 | 16 |
| 152.06361389160156 | 15 |
| 35.24803924560547 | 13 |
| 132.803955078125 | 21 |
| 261.28424072265625 | 17 |
| 167.9145965576172 | 21 |
| 160.1216583251953 | 21 |
| 169.92507934570312 | 18 |
| 170.918701171875 | 15 |
| 126.93059539794922 | 18 |
| 127.46913146972656 | 14 |
| 35.24803924560547 | 14 |
| 117.21380615234375 | 17 |
| 136.72714233398438 | 19 |
| 151.18980407714844 | 16 |
| 117.21380615234375 | 14 |
| 159.6134033203125 | 14 |
| 41.77260208129883 | 17 |
| 160.1216583251953 | 14 |
| 152.79701232910156 | 17 |
| 263.26287841796875 | 18 |
| 139.8406524658203 | 21 |
| 261.28424072265625 | 15 |
| 65.05460357666016 | 15 |
| 65.05460357666016 | 16 |
| 116.08311462402344 | 14 |
| 112.14165496826172 | 14 |
| 135.17410278320312 | 21 |
| 169.18894958496094 | 17 |
| 106.45875549316406 | 16 |
| 152.79701232910156 | 18 |
| 107.1012191772461 | 17 |
| 261.28424072265625 | 12 |
| 170.918701171875 | 12 |
| 355.2670593261719 | 24 |
| 355.2670593261719 | 23 |
| 133.157958984375 | 24 |
| 142.1875 | 24 |
| 101.02889251708984 | 28 |
| 95.65730285644531 | 21 |
| 95.65730285644531 | 23 |
| 222.82325744628906 | 22 |
| 195.7181854248047 | 20 |
| 98.83321380615234 | 20 |
| 98.83321380615234 | 17 |
| 138.04306030273438 | 17 |
| 188.9888458251953 | 14 |
| 229.70811462402344 | 18 |
| 222.50682067871094 | 20 |
| 222.82325744628906 | 17 |
| 26.501304626464844 | 19 |
| 138.9110870361328 | 18 |
| 76.89350128173828 | 22 |
| 60.515716552734375 | 17 |
| 195.74801635742188 | 15 |
| 303.1136474609375 | 22 |
| 38.00228500366211 | 22 |
| 87.13581085205078 | 15 |
| 33.218997955322266 | 19 |
| 44.85414505004883 | 17 |
| 117.68586730957031 | 18 |
| 87.29019165039062 | 20 |
| 11.15339183807373 | 20 |
| 117.68586730957031 | 14 |
| 33.6616325378418 | 21 |
| 20.857500076293945 | 18 |
| 41.78570556640625 | 21 |
| 117.68586730957031 | 17 |
| 101.94845581054688 | 16 |
| 20.992891311645508 | 19 |
| 105.4623031616211 | 20 |
| 38.69794464111328 | 23 |
| 96.85697937011719 | 18 |
| 285.7601623535156 | 20 |
| 220.61895751953125 | 21 |
| 189.8977508544922 | 22 |
| 89.82001495361328 | 20 |
| 98.75871276855469 | 21 |
| 38.41945266723633 | 16 |
| 25.042207717895508 | 25 |
| 111.1221923828125 | 24 |
| 89.82001495361328 | 20 |
| 145.2718505859375 | 21 |
| 71.20179748535156 | 19 |
| 32.63823318481445 | 18 |
| 145.2718505859375 | 16 |
| 145.2718505859375 | 16 |
| 69.49874114990234 | 20 |
| 69.2525405883789 | 20 |
| 145.2718505859375 | 15 |
| 141.51223754882812 | 18 |
| 33.07023239135742 | 13 |
| 272.3555603027344 | 16 |
| 173.27024841308594 | 20 |
| 26.7891845703125 | 18 |
| 383.044189453125 | 21 |
| 17.637632369995117 | 22 |
| 25.76298713684082 | 21 |
| 296.0251159667969 | 20 |
| 141.51223754882812 | 16 |
| 53.32505416870117 | 20 |
| 33.84675216674805 | 17 |
| 173.27024841308594 | 16 |
| 82.88993835449219 | 17 |
| 248.92401123046875 | 21 |
| 18.65378761291504 | 21 |
| 82.88993835449219 | 18 |
| 25.042207717895508 | 18 |
| 137.2830047607422 | 18 |
| 25.76298713684082 | 16 |
| 0.0 | 22 |
| 139.67555236816406 | 21 |
| 246.4601593017578 | 17 |
| 383.044189453125 | 18 |
| 102.64675903320312 | 18 |
| 102.64675903320312 | 10 |
| 45.937461853027344 | 13 |
| 111.1676254272461 | 22 |
| 33.33373260498047 | 22 |
| 297.3058776855469 | 19 |
| 48.720149993896484 | 17 |
| 0.0 | 23 |
| 127.05033874511719 | 16 |
| 383.044189453125 | 19 |
| 141.51223754882812 | 17 |
| 152.79701232910156 | 18 |
| 55.06306838989258 | 22 |
| 55.06306838989258 | 23 |
| 241.68304443359375 | 25 |
| 233.98838806152344 | 26 |
| 278.25018310546875 | 25 |
| 285.5780944824219 | 19 |
| 285.5780944824219 | 23 |
| 164.54611206054688 | 19 |
| 187.63717651367188 | 14 |
| 272.3857116699219 | 18 |
| 272.3857116699219 | 16 |
| 236.586181640625 | 16 |
| 196.5904998779297 | 20 |
| 158.61074829101562 | 20 |
| 164.59230041503906 | 18 |
| 164.54611206054688 | 16 |
| 389.7649841308594 | 22 |
| 249.38250732421875 | 18 |
| 300.0872802734375 | 22 |
| 314.3141174316406 | 17 |
| 192.86648559570312 | 15 |
| 123.55650329589844 | 21 |
| 332.8261413574219 | 21 |
| 286.1507873535156 | 20 |
| 337.3935852050781 | 18 |
| 325.8920593261719 | 16 |
| 255.43011474609375 | 20 |
| 286.2047119140625 | 19 |
| 361.3630676269531 | 20 |
| 255.43011474609375 | 17 |
| 336.9202880859375 | 20 |
| 351.3808898925781 | 16 |
| 328.80572509765625 | 22 |
| 255.43011474609375 | 15 |
| 274.2248229980469 | 13 |
| 388.4920654296875 | 18 |
| 265.52154541015625 | 17 |
| 334.7697448730469 | 18 |
| 297.3355712890625 | 17 |
| 134.48472595214844 | 19 |
| 165.6787872314453 | 19 |
| 205.99102783203125 | 22 |
| 302.8980407714844 | 16 |
| 276.96868896484375 | 23 |
| 337.2833251953125 | 17 |
| 388.8563537597656 | 24 |
| 477.2675476074219 | 21 |
| 302.8980407714844 | 24 |
| 247.6277618408203 | 16 |
| 437.5498962402344 | 20 |
| 337.97308349609375 | 20 |
| 247.6277618408203 | 14 |
| 247.6277618408203 | 19 |
| 303.3659362792969 | 15 |
| 436.0657653808594 | 19 |
| 247.6277618408203 | 14 |
| 429.79803466796875 | 20 |
| 337.5870056152344 | 17 |
| 106.890869140625 | 20 |
| 223.9331817626953 | 20 |
| 343.8603210449219 | 19 |
| 33.065067291259766 | 21 |
| 388.2097473144531 | 19 |
| 389.57647705078125 | 19 |
| 92.26129913330078 | 19 |
| 429.79803466796875 | 15 |
| 320.13800048828125 | 18 |
| 361.2080383300781 | 17 |
| 223.9331817626953 | 16 |
| 291.3857116699219 | 17 |
| 124.94005584716797 | 20 |
| 379.07183837890625 | 21 |
| 291.3857116699219 | 15 |
| 388.8563537597656 | 15 |
| 244.7150421142578 | 16 |
| 389.57647705078125 | 20 |
| 370.5785217285156 | 19 |
| 505.55975341796875 | 20 |
| 125.26404571533203 | 25 |
| 33.065067291259766 | 16 |
| 319.97662353515625 | 18 |
| 319.97662353515625 | 16 |
| 324.7055969238281 | 15 |
| 263.3546142578125 | 19 |
| 339.10418701171875 | 23 |
| 94.861083984375 | 21 |
| 340.7159729003906 | 19 |
| 370.5785217285156 | 22 |
| 246.2008056640625 | 19 |
| 33.065067291259766 | 19 |
| 429.79803466796875 | 20 |
| 258.9515380859375 | 18 |
| 370.5785217285156 | 15 |
| 402.5054626464844 | 25 |
| 402.5054626464844 | 20 |
| 182.5557861328125 | 26 |
| 190.37741088867188 | 21 |
| 146.08753967285156 | 26 |
| 138.88780212402344 | 20 |
| 138.88780212402344 | 24 |
| 286.0072326660156 | 22 |
| 259.1222229003906 | 18 |
| 159.90464782714844 | 16 |
| 159.90464782714844 | 14 |
| 200.6077423095703 | 14 |
| 253.22434997558594 | 21 |
| 292.7893981933594 | 19 |
| 285.648193359375 | 21 |
| 286.0072326660156 | 17 |
| 43.200653076171875 | 24 |
| 205.91519165039062 | 20 |
| 143.90542602539062 | 23 |
| 127.55853271484375 | 21 |
| 260.3470764160156 | 14 |
| 367.3667907714844 | 18 |
| 98.7946548461914 | 19 |
| 151.39346313476562 | 18 |
| 97.36180877685547 | 18 |
| 105.26786041259766 | 16 |
| 180.1256103515625 | 20 |
| 151.70651245117188 | 19 |
| 80.70520782470703 | 16 |
| 180.1256103515625 | 17 |
| 97.28338623046875 | 19 |
| 89.50206756591797 | 19 |
| 104.6629638671875 | 22 |
| 180.1256103515625 | 16 |
| 167.1688995361328 | 18 |
| 49.19988250732422 | 16 |
| 165.6693878173828 | 19 |
| 106.5730972290039 | 20 |
| 129.97019958496094 | 18 |
| 350.35943603515625 | 19 |
| 283.66998291015625 | 19 |
| 256.01678466796875 | 18 |
| 123.51068878173828 | 20 |
| 163.92808532714844 | 24 |
| 107.29844665527344 | 13 |
| 44.6451530456543 | 19 |
| 55.748268127441406 | 18 |
| 123.51068878173828 | 21 |
| 212.7902374267578 | 21 |
| 26.089651107788086 | 20 |
| 96.84199523925781 | 16 |
| 212.7902374267578 | 14 |
| 212.7902374267578 | 17 |
| 134.541259765625 | 22 |
| 26.868104934692383 | 16 |
| 212.7902374267578 | 18 |
| 90.22557067871094 | 14 |
| 97.5733642578125 | 14 |
| 321.15283203125 | 18 |
| 210.42733764648438 | 19 |
| 92.06588745117188 | 18 |
| 433.08087158203125 | 14 |
| 58.42457580566406 | 17 |
| 43.91599655151367 | 19 |
| 343.032958984375 | 15 |
| 90.22557067871094 | 14 |
| 120.04328918457031 | 18 |
| 63.683135986328125 | 19 |
| 210.42733764648438 | 16 |
| 148.1378631591797 | 15 |
| 299.8016662597656 | 13 |
| 52.72270965576172 | 20 |
| 148.1378631591797 | 13 |
| 44.6451530456543 | 11 |
| 180.93875122070312 | 15 |
| 43.91599655151367 | 14 |
| 69.67430877685547 | 20 |
| 82.43350219726562 | 16 |
| 298.9750671386719 | 17 |
| 433.08087158203125 | 15 |
| 117.62217712402344 | 12 |
| 117.62217712402344 | 15 |
| 106.90233612060547 | 14 |
| 174.96966552734375 | 18 |
| 100.94280242919922 | 23 |
| 343.45721435546875 | 12 |
| 83.53507995605469 | 12 |
| 69.67430877685547 | 28 |
| 189.15435791015625 | 14 |
| 433.08087158203125 | 15 |
| 90.22557067871094 | 16 |
| 181.4359130859375 | 16 |
| 69.67430877685547 | 17 |
| 424.23876953125 | 16 |
| 55.06306838989258 | 23 |
| 55.06306838989258 | 23 |
| 241.68304443359375 | 22 |
| 233.98838806152344 | 24 |
| 278.25018310546875 | 24 |
| 285.5780944824219 | 21 |
| 285.5780944824219 | 20 |
| 164.54611206054688 | 20 |
| 187.63717651367188 | 19 |
| 272.3857116699219 | 16 |
| 272.3857116699219 | 16 |
| 236.586181640625 | 15 |
| 196.5904998779297 | 20 |
| 158.61074829101562 | 21 |
| 164.59230041503906 | 18 |
| 164.54611206054688 | 17 |
| 389.7649841308594 | 23 |
| 249.38250732421875 | 20 |
| 300.0872802734375 | 21 |
| 314.3141174316406 | 19 |
| 192.86648559570312 | 16 |
| 123.55650329589844 | 17 |
| 332.8261413574219 | 18 |
| 286.1507873535156 | 20 |
| 337.3935852050781 | 19 |
| 325.8920593261719 | 17 |
| 255.43011474609375 | 19 |
| 286.2047119140625 | 17 |
| 361.3630676269531 | 17 |
| 255.43011474609375 | 15 |
| 336.9202880859375 | 20 |
| 351.3808898925781 | 18 |
| 328.80572509765625 | 18 |
| 255.43011474609375 | 15 |
| 274.2248229980469 | 19 |
| 388.4920654296875 | 16 |
| 265.52154541015625 | 17 |
| 334.7697448730469 | 18 |
| 297.3355712890625 | 17 |
| 134.48472595214844 | 19 |
| 165.6787872314453 | 14 |
| 205.99102783203125 | 21 |
| 302.8980407714844 | 18 |
| 276.96868896484375 | 23 |
| 337.2833251953125 | 16 |
| 388.8563537597656 | 23 |
| 477.2675476074219 | 21 |
| 302.8980407714844 | 22 |
| 247.6277618408203 | 21 |
| 437.5498962402344 | 19 |
| 337.97308349609375 | 17 |
| 247.6277618408203 | 13 |
| 247.6277618408203 | 20 |
| 303.3659362792969 | 20 |
| 436.0657653808594 | 20 |
| 247.6277618408203 | 17 |
| 429.79803466796875 | 16 |
| 337.5870056152344 | 17 |
| 106.890869140625 | 19 |
| 223.9331817626953 | 18 |
| 343.8603210449219 | 20 |
| 33.065067291259766 | 18 |
| 388.2097473144531 | 17 |
| 389.57647705078125 | 19 |
| 92.26129913330078 | 19 |
| 429.79803466796875 | 16 |
| 320.13800048828125 | 18 |
| 361.2080383300781 | 18 |
| 223.9331817626953 | 17 |
| 291.3857116699219 | 16 |
| 124.94005584716797 | 18 |
| 379.07183837890625 | 19 |
| 291.3857116699219 | 15 |
| 388.8563537597656 | 16 |
| 244.7150421142578 | 15 |
| 389.57647705078125 | 17 |
| 370.5785217285156 | 21 |
| 505.55975341796875 | 18 |
| 125.26404571533203 | 21 |
| 33.065067291259766 | 17 |
| 319.97662353515625 | 16 |
| 319.97662353515625 | 13 |
| 324.7055969238281 | 13 |
| 263.3546142578125 | 17 |
| 339.10418701171875 | 23 |
| 94.861083984375 | 16 |
| 340.7159729003906 | 15 |
| 370.5785217285156 | 27 |
| 246.2008056640625 | 16 |
| 33.065067291259766 | 16 |
| 429.79803466796875 | 17 |
| 258.9515380859375 | 14 |
| 370.5785217285156 | 14 |
| 0.0 | 15 |
| 424.23876953125 | 11 |
| 36.5926513671875 | 26 |
| 36.5926513671875 | 23 |
| 251.40980529785156 | 25 |
| 243.0823211669922 | 24 |
| 287.2122497558594 | 26 |
| 294.27020263671875 | 19 |
| 294.27020263671875 | 21 |
| 187.36036682128906 | 19 |
| 208.35459899902344 | 20 |
| 286.3294982910156 | 18 |
| 286.3294982910156 | 15 |
| 252.94503784179688 | 14 |
| 217.4719696044922 | 21 |
| 181.96270751953125 | 20 |
| 187.33859252929688 | 20 |
| 187.36036682128906 | 19 |
| 400.7041931152344 | 23 |
| 268.6568298339844 | 19 |
| 315.528564453125 | 19 |
| 328.9214172363281 | 18 |
| 214.59022521972656 | 17 |
| 154.75836181640625 | 21 |
| 345.0577087402344 | 21 |
| 300.915283203125 | 21 |
| 350.10687255859375 | 21 |
| 338.1900329589844 | 18 |
| 270.73431396484375 | 19 |
| 301.0413513183594 | 21 |
| 374.3745422363281 | 20 |
| 270.73431396484375 | 14 |
| 349.54864501953125 | 18 |
| 364.5890808105469 | 14 |
| 341.5155944824219 | 14 |
| 270.73431396484375 | 16 |
| 290.1431579589844 | 16 |
| 400.0255126953125 | 14 |
| 279.333251953125 | 17 |
| 348.603759765625 | 16 |
| 304.1761169433594 | 15 |
| 164.43185424804688 | 21 |
| 188.17202758789062 | 16 |
| 228.47128295898438 | 22 |
| 310.1771545410156 | 21 |
| 292.6960754394531 | 24 |
| 351.4764404296875 | 16 |
| 399.8908996582031 | 16 |
| 487.1802978515625 | 21 |
| 310.1771545410156 | 22 |
| 267.738037109375 | 22 |
| 447.98614501953125 | 19 |
| 350.6805419921875 | 24 |
| 267.738037109375 | 14 |
| 267.738037109375 | 17 |
| 317.6567077636719 | 17 |
| 446.6300354003906 | 22 |
| 267.738037109375 | 23 |
| 431.7892761230469 | 13 |
| 350.365234375 | 16 |
| 111.93114471435547 | 17 |
| 227.1354522705078 | 18 |
| 356.584716796875 | 19 |
| 0.0 | 14 |
| 400.65740966796875 | 15 |
| 400.5871276855469 | 23 |
| 91.39067077636719 | 17 |
| 431.7892761230469 | 16 |
| 334.28228759765625 | 18 |
| 370.98077392578125 | 20 |
| 227.1354522705078 | 14 |
| 306.36322021484375 | 16 |
| 134.175048828125 | 18 |
| 390.16180419921875 | 17 |
| 306.36322021484375 | 18 |
| 399.8908996582031 | 17 |
| 252.2074432373047 | 18 |
| 400.5871276855469 | 19 |
| 383.044189453125 | 17 |
| 515.130859375 | 16 |
| 136.80654907226562 | 22 |
| 0.0 | 15 |
| 324.47259521484375 | 15 |
| 324.47259521484375 | 20 |
| 337.13299560546875 | 15 |
| 279.03521728515625 | 17 |
| 352.60614013671875 | 21 |
| 92.18943786621094 | 17 |
| 349.9622802734375 | 15 |
| 383.044189453125 | 21 |
| 261.7575378417969 | 17 |
| 0.0 | 13 |
| 431.7892761230469 | 14 |
| 261.28424072265625 | 15 |
| 383.044189453125 | 20 |
| 33.065067291259766 | 20 |
| 433.08087158203125 | 16 |
| 33.065067291259766 | 14 |
| 252.5496368408203 | 31 |
| 252.5496368408203 | 29 |
| 41.78599548339844 | 24 |
| 50.37015914916992 | 24 |
| 43.76298141479492 | 24 |
| 48.7907829284668 | 27 |
| 48.7907829284668 | 28 |
| 120.31608581542969 | 23 |
| 93.71797943115234 | 24 |
| 7.954472064971924 | 21 |
| 7.954472064971924 | 21 |
| 35.590049743652344 | 20 |
| 88.64899444580078 | 16 |
| 127.0335693359375 | 21 |
| 119.94071197509766 | 24 |
| 120.31608581542969 | 21 |
| 127.14278411865234 | 24 |
| 53.10642623901367 | 22 |
| 39.88823318481445 | 19 |
| 50.75320816040039 | 25 |
| 96.07666778564453 | 23 |
| 201.92431640625 | 27 |
| 68.90678405761719 | 25 |
| 24.024967193603516 | 27 |
| 72.82061767578125 | 25 |
| 61.991294860839844 | 21 |
| 16.7515811920166 | 22 |
| 24.4008731842041 | 17 |
| 96.54180145263672 | 22 |
| 16.7515811920166 | 21 |
| 72.43087768554688 | 23 |
| 86.52827453613281 | 24 |
| 64.30101013183594 | 26 |
| 16.7515811920166 | 19 |
| 23.1946964263916 | 22 |
| 124.86991119384766 | 25 |
| 1.176010251045227 | 25 |
| 70.07132720947266 | 24 |
| 68.91886901855469 | 21 |
| 185.21621704101562 | 23 |
| 117.93429565429688 | 25 |
| 94.67066192626953 | 26 |
| 68.6944808959961 | 26 |
| 23.06602668762207 | 24 |
| 72.9226303100586 | 21 |
| 126.0673599243164 | 28 |
| 215.34481811523438 | 26 |
| 68.6944808959961 | 29 |
| 61.33469772338867 | 28 |
| 175.14572143554688 | 27 |
| 73.40149688720703 | 15 |
| 61.33469772338867 | 21 |
| 61.33469772338867 | 20 |
| 39.25822830200195 | 21 |
| 173.45062255859375 | 22 |
| 61.33469772338867 | 23 |
| 202.37001037597656 | 15 |
| 72.95849609375 | 23 |
| 169.662353515625 | 21 |
| 93.64134216308594 | 26 |
| 79.24007415771484 | 26 |
| 278.566650390625 | 22 |
| 123.60230255126953 | 22 |
| 126.8202896118164 | 25 |
| 194.2535858154297 | 19 |
| 202.37001037597656 | 18 |
| 55.73658752441406 | 23 |
| 102.67019653320312 | 24 |
| 93.64134216308594 | 20 |
| 29.7817325592041 | 19 |
| 145.1845245361328 | 25 |
| 116.35330963134766 | 24 |
| 29.7817325592041 | 22 |
| 126.0673599243164 | 22 |
| 56.58967971801758 | 23 |
| 126.8202896118164 | 25 |
| 106.02867889404297 | 20 |
| 243.96786499023438 | 23 |
| 141.7724609375 | 23 |
| 278.566650390625 | 21 |
| 99.59244537353516 | 22 |
| 99.59244537353516 | 18 |
| 60.615867614746094 | 21 |
| 18.070226669311523 | 26 |
| 74.26235961914062 | 14 |
| 196.1866912841797 | 20 |
| 85.88967895507812 | 21 |
| 106.02867889404297 | 32 |
| 24.151159286499023 | 22 |
| 278.566650390625 | 19 |
| 202.37001037597656 | 20 |
| 95.05171203613281 | 24 |
| 106.02867889404297 | 17 |
| 264.8580627441406 | 21 |
| 165.94317626953125 | 17 |
| 264.8580627441406 | 19 |
| 278.566650390625 | 17 |
| 399.30487060546875 | 25 |
| 399.30487060546875 | 23 |
| 176.84063720703125 | 24 |
| 185.61175537109375 | 24 |
| 142.80783081054688 | 24 |
| 136.6183624267578 | 17 |
| 136.6183624267578 | 20 |
| 268.35137939453125 | 22 |
| 241.24859619140625 | 20 |
| 144.54539489746094 | 18 |
| 144.54539489746094 | 16 |
| 183.7512664794922 | 15 |
| 234.37338256835938 | 13 |
| 275.2440185546875 | 21 |
| 268.0419921875 | 17 |
| 268.35137939453125 | 13 |
| 29.168865203857422 | 25 |
| 183.45681762695312 | 16 |
| 121.93412780761719 | 22 |
| 105.73959350585938 | 19 |
| 241.03079223632812 | 14 |
| 348.3206787109375 | 20 |
| 83.08160400390625 | 19 |
| 132.80165100097656 | 21 |
| 78.86653900146484 | 17 |
| 90.02244567871094 | 16 |
| 163.42144775390625 | 19 |
| 132.93710327148438 | 21 |
| 56.02217483520508 | 15 |
| 163.42144775390625 | 14 |
| 79.24131774902344 | 20 |
| 66.1748046875 | 21 |
| 87.3714599609375 | 21 |
| 163.42144775390625 | 19 |
| 147.38967895507812 | 16 |
| 27.89381217956543 | 15 |
| 151.12954711914062 | 14 |
| 83.9229965209961 | 18 |
| 133.59243774414062 | 16 |
| 330.8907165527344 | 20 |
| 266.1700744628906 | 15 |
| 234.6721954345703 | 18 |
| 126.52740478515625 | 20 |
| 144.22738647460938 | 26 |
| 82.88581085205078 | 17 |
| 29.47713279724121 | 19 |
| 66.58451843261719 | 23 |
| 126.52740478515625 | 21 |
| 189.44430541992188 | 16 |
| 28.69099235534668 | 20 |
| 78.28604888916016 | 23 |
| 189.44430541992188 | 16 |
| 189.44430541992188 | 17 |
| 115.1419906616211 | 21 |
| 26.431665420532227 | 17 |
| 189.44430541992188 | 19 |
| 130.24545288085938 | 16 |
| 78.75745391845703 | 15 |
| 316.5948791503906 | 20 |
| 213.29205322265625 | 19 |
| 72.48921203613281 | 12 |
| 427.74609375 | 17 |
| 28.534055709838867 | 16 |
| 28.938953399658203 | 19 |
| 339.884033203125 | 15 |
| 130.24545288085938 | 15 |
| 98.75349426269531 | 15 |
| 61.57250213623047 | 20 |
| 213.29205322265625 | 16 |
| 128.42672729492188 | 16 |
| 293.5711669921875 | 18 |
| 38.51276397705078 | 20 |
| 128.42672729492188 | 15 |
| 29.47713279724121 | 17 |
| 179.2025604248047 | 19 |
| 28.938953399658203 | 18 |
| 45.74760437011719 | 19 |
| 94.78688049316406 | 17 |
| 291.42864990234375 | 24 |
| 427.74609375 | 18 |
| 130.74441528320312 | 19 |
| 130.74441528320312 | 20 |
| 91.25042724609375 | 15 |
| 156.81405639648438 | 16 |
| 78.78536987304688 | 21 |
| 340.9454650878906 | 19 |
| 82.84253692626953 | 18 |
| 45.74760437011719 | 28 |
| 172.78997802734375 | 14 |
| 427.74609375 | 21 |
| 130.24545288085938 | 17 |
| 189.03936767578125 | 22 |
| 45.74760437011719 | 18 |
| 415.8973693847656 | 18 |
| 41.253395080566406 | 16 |
| 415.8973693847656 | 19 |
| 427.74609375 | 18 |
| 151.6721649169922 | 24 |
| 36.5926513671875 | 23 |
| 36.5926513671875 | 26 |
| 251.40980529785156 | 27 |
| 243.0823211669922 | 28 |
| 287.2122497558594 | 30 |
| 294.27020263671875 | 26 |
| 294.27020263671875 | 27 |
| 187.36036682128906 | 25 |
| 208.35459899902344 | 23 |
| 286.3294982910156 | 18 |
| 286.3294982910156 | 17 |
| 252.94503784179688 | 17 |
| 217.4719696044922 | 18 |
| 181.96270751953125 | 17 |
| 187.33859252929688 | 24 |
| 187.36036682128906 | 22 |
| 400.7041931152344 | 23 |
| 268.6568298339844 | 17 |
| 315.528564453125 | 21 |
| 328.9214172363281 | 19 |
| 214.59022521972656 | 18 |
| 154.75836181640625 | 21 |
| 345.0577087402344 | 24 |
| 300.915283203125 | 20 |
| 350.10687255859375 | 19 |
| 338.1900329589844 | 19 |
| 270.73431396484375 | 20 |
| 301.0413513183594 | 22 |
| 374.3745422363281 | 21 |
| 270.73431396484375 | 17 |
| 349.54864501953125 | 21 |
| 364.5890808105469 | 19 |
| 341.5155944824219 | 24 |
| 270.73431396484375 | 18 |
| 290.1431579589844 | 21 |
| 400.0255126953125 | 22 |
| 279.333251953125 | 19 |
| 348.603759765625 | 21 |
| 304.1761169433594 | 18 |
| 164.43185424804688 | 21 |
| 188.17202758789062 | 22 |
| 228.47128295898438 | 24 |
| 310.1771545410156 | 18 |
| 292.6960754394531 | 22 |
| 351.4764404296875 | 15 |
| 399.8908996582031 | 25 |
| 487.1802978515625 | 23 |
| 310.1771545410156 | 25 |
| 267.738037109375 | 24 |
| 447.98614501953125 | 21 |
| 350.6805419921875 | 24 |
| 267.738037109375 | 15 |
| 267.738037109375 | 14 |
| 317.6567077636719 | 18 |
| 446.6300354003906 | 22 |
| 267.738037109375 | 25 |
| 431.7892761230469 | 19 |
| 350.365234375 | 19 |
| 111.93114471435547 | 21 |
| 227.1354522705078 | 19 |
| 356.584716796875 | 23 |
| 0.0 | 22 |
| 400.65740966796875 | 23 |
| 400.5871276855469 | 21 |
| 91.39067077636719 | 18 |
| 431.7892761230469 | 15 |
| 334.28228759765625 | 22 |
| 370.98077392578125 | 15 |
| 227.1354522705078 | 18 |
| 306.36322021484375 | 19 |
| 134.175048828125 | 24 |
| 390.16180419921875 | 18 |
| 306.36322021484375 | 20 |
| 399.8908996582031 | 17 |
| 252.2074432373047 | 20 |
| 400.5871276855469 | 21 |
| 383.044189453125 | 22 |
| 515.130859375 | 18 |
| 136.80654907226562 | 21 |
| 0.0 | 19 |
| 324.47259521484375 | 17 |
| 324.47259521484375 | 15 |
| 337.13299560546875 | 19 |
| 279.03521728515625 | 16 |
| 352.60614013671875 | 24 |
| 92.18943786621094 | 18 |
| 349.9622802734375 | 17 |
| 383.044189453125 | 24 |
| 261.7575378417969 | 19 |
| 0.0 | 17 |
| 431.7892761230469 | 15 |
| 261.28424072265625 | 16 |
| 383.044189453125 | 16 |
| 33.065067291259766 | 21 |
| 433.08087158203125 | 20 |
| 33.065067291259766 | 20 |
| 0.0 | 18 |
| 278.566650390625 | 19 |
| 427.74609375 | 23 |
| 291.7371826171875 | 21 |
| 291.7371826171875 | 19 |
| 88.4844970703125 | 24 |
| 92.62115478515625 | 29 |
| 57.418949127197266 | 25 |
| 51.10765075683594 | 19 |
| 51.10765075683594 | 20 |
| 207.07752990722656 | 18 |
| 183.48814392089844 | 20 |
| 99.09115600585938 | 19 |
| 99.09115600585938 | 16 |
| 131.6299285888672 | 18 |
| 181.01173400878906 | 20 |
| 212.99366760253906 | 18 |
| 206.6197967529297 | 24 |
| 207.07752990722656 | 20 |
| 102.23941040039062 | 20 |
| 152.665771484375 | 21 |
| 110.39916229248047 | 22 |
| 102.89813995361328 | 21 |
| 188.5788116455078 | 13 |
| 286.73809814453125 | 22 |
| 81.64678955078125 | 23 |
| 103.96131134033203 | 18 |
| 88.33795928955078 | 22 |
| 80.40087127685547 | 16 |
| 116.09303283691406 | 20 |
| 104.66266632080078 | 25 |
| 102.68656158447266 | 20 |
| 116.09303283691406 | 19 |
| 87.26103973388672 | 20 |
| 99.55626678466797 | 20 |
| 85.54222106933594 | 21 |
| 116.09303283691406 | 15 |
| 116.75829315185547 | 21 |
| 106.353271484375 | 16 |
| 100.19847869873047 | 21 |
| 99.49376678466797 | 25 |
| 31.04448699951172 | 18 |
| 271.70556640625 | 23 |
| 204.5388641357422 | 20 |
| 190.7052764892578 | 16 |
| 31.126476287841797 | 18 |
| 114.5073013305664 | 21 |
| 104.28362274169922 | 16 |
| 102.335205078125 | 19 |
| 173.2515106201172 | 22 |
| 31.126476287841797 | 23 |
| 160.89837646484375 | 22 |
| 139.3029022216797 | 15 |
| 88.4888687133789 | 24 |
| 160.89837646484375 | 17 |
| 160.89837646484375 | 17 |
| 98.48355102539062 | 17 |
| 138.79563903808594 | 18 |
| 160.89837646484375 | 19 |
| 112.3104476928711 | 16 |
| 89.10140991210938 | 21 |
| 213.65121459960938 | 19 |
| 97.45022583007812 | 19 |
| 91.01577758789062 | 22 |
| 324.47259521484375 | 21 |
| 114.4152603149414 | 22 |
| 102.69097137451172 | 17 |
| 233.14694213867188 | 19 |
| 112.3104476928711 | 18 |
| 98.92837524414062 | 18 |
| 71.25638580322266 | 13 |
| 97.45022583007812 | 15 |
| 105.64391326904297 | 21 |
| 195.5750274658203 | 19 |
| 95.48280334472656 | 20 |
| 105.64391326904297 | 21 |
| 102.335205078125 | 20 |
| 78.34785461425781 | 19 |
| 102.69097137451172 | 19 |
| 102.64675903320312 | 23 |
| 198.742431640625 | 22 |
| 197.00857543945312 | 19 |
| 324.47259521484375 | 22 |
| 0.0 | 14 |
| 0.0 | 20 |
| 81.49604034423828 | 15 |
| 116.88584899902344 | 25 |
| 97.43501281738281 | 23 |
| 232.79818725585938 | 17 |
| 54.167236328125 | 18 |
| 102.64675903320312 | 23 |
| 121.56904602050781 | 19 |
| 324.47259521484375 | 16 |
| 112.3104476928711 | 15 |
| 65.05460357666016 | 16 |
| 102.64675903320312 | 20 |
| 319.97662353515625 | 21 |
| 117.62217712402344 | 18 |
| 319.97662353515625 | 20 |
| 324.47259521484375 | 21 |
| 99.59244537353516 | 26 |
| 130.74441528320312 | 21 |
| 324.47259521484375 | 21 |
| 193.57894897460938 | 23 |
| 193.57894897460938 | 22 |
| 100.25071716308594 | 23 |
| 99.34187316894531 | 26 |
| 130.4183349609375 | 23 |
| 137.56573486328125 | 23 |
| 137.56573486328125 | 23 |
| 26.42660140991211 | 22 |
| 5.055485725402832 | 16 |
| 101.29926300048828 | 20 |
| 101.29926300048828 | 19 |
| 60.56315612792969 | 18 |
| 8.081847190856934 | 21 |
| 33.29020309448242 | 16 |
| 26.192873001098633 | 21 |
| 26.42660140991211 | 18 |
| 220.49127197265625 | 23 |
| 61.967193603515625 | 20 |
| 120.5533447265625 | 22 |
| 136.6317901611328 | 16 |
| 5.087334632873535 | 19 |
| 106.44784545898438 | 21 |
| 162.3948516845703 | 18 |
| 110.0890121459961 | 19 |
| 164.82720947265625 | 20 |
| 155.7646484375 | 13 |
| 80.89447784423828 | 20 |
| 109.86557006835938 | 22 |
| 186.364013671875 | 19 |
| 80.89447784423828 | 16 |
| 164.6975555419922 | 17 |
| 176.23834228515625 | 18 |
| 156.8695068359375 | 16 |
| 80.89447784423828 | 20 |
| 95.0050277709961 | 19 |
| 217.17779541015625 | 17 |
| 96.08863067626953 | 19 |
| 158.44705200195312 | 16 |
| 156.5164337158203 | 19 |
| 89.41620635986328 | 17 |
| 24.555967330932617 | 18 |
| 19.99349021911621 | 19 |
| 158.74609375 | 16 |
| 98.19084930419922 | 17 |
| 159.6508026123047 | 15 |
| 219.28717041015625 | 18 |
| 308.0022888183594 | 21 |
| 158.74609375 | 18 |
| 58.972679138183594 | 17 |
| 267.89385986328125 | 20 |
| 165.38858032226562 | 27 |
| 58.972679138183594 | 17 |
| 58.972679138183594 | 18 |
| 127.56560516357422 | 19 |
| 266.030029296875 | 18 |
| 58.972679138183594 | 22 |
| 295.9674987792969 | 18 |
| 164.77137756347656 | 19 |
| 120.95307159423828 | 21 |
| 128.79408264160156 | 18 |
| 170.8292236328125 | 17 |
| 210.44264221191406 | 18 |
| 213.8338623046875 | 21 |
| 220.055419921875 | 19 |
| 145.1068115234375 | 16 |
| 295.9674987792969 | 15 |
| 143.65277099609375 | 19 |
| 198.28890991210938 | 16 |
| 128.79408264160156 | 18 |
| 114.0728988647461 | 19 |
| 97.02088928222656 | 17 |
| 209.83555603027344 | 17 |
| 114.0728988647461 | 18 |
| 219.28717041015625 | 16 |
| 115.04295349121094 | 20 |
| 220.055419921875 | 13 |
| 196.94955444335938 | 14 |
| 336.5970458984375 | 21 |
| 88.46751403808594 | 25 |
| 210.44264221191406 | 19 |
| 187.0714569091797 | 21 |
| 187.0714569091797 | 22 |
| 154.17384338378906 | 20 |
| 86.15612030029297 | 20 |
| 163.6512451171875 | 22 |
| 149.17491149902344 | 21 |
| 181.89659118652344 | 19 |
| 196.94955444335938 | 26 |
| 72.08647155761719 | 19 |
| 210.44264221191406 | 22 |
| 295.9674987792969 | 16 |
| 153.6428680419922 | 19 |
| 196.94955444335938 | 23 |
| 189.1174774169922 | 17 |
| 260.9550476074219 | 19 |
| 189.1174774169922 | 22 |
| 210.44264221191406 | 21 |
| 96.0147476196289 | 26 |
| 242.3678741455078 | 19 |
| 210.44264221191406 | 24 |
| 187.0714569091797 | 23 |